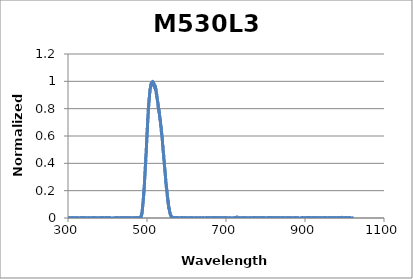
| Category | Normalized Intensity |
|---|---|
| 194.11 | 0.001 |
| 194.31 | -0.001 |
| 194.52 | 0 |
| 194.72 | -0.001 |
| 194.92 | 0 |
| 195.12 | 0 |
| 195.33 | 0.001 |
| 195.53 | -0.002 |
| 195.73 | -0.001 |
| 195.93 | 0 |
| 196.13 | -0.001 |
| 196.34 | -0.003 |
| 196.54 | 0 |
| 196.74 | -0.001 |
| 196.94 | -0.001 |
| 197.15 | -0.003 |
| 197.35 | -0.001 |
| 197.55 | -0.002 |
| 197.75 | -0.001 |
| 197.96 | -0.001 |
| 198.16 | -0.002 |
| 198.36 | -0.001 |
| 198.56 | 0 |
| 198.76 | 0 |
| 198.97 | 0.001 |
| 199.17 | -0.001 |
| 199.37 | 0.002 |
| 199.57 | -0.001 |
| 199.78 | 0 |
| 199.98 | 0 |
| 200.18 | -0.002 |
| 200.39 | 0.001 |
| 200.59 | -0.003 |
| 200.79 | -0.002 |
| 200.99 | -0.001 |
| 201.2 | 0.001 |
| 201.4 | -0.001 |
| 201.6 | 0 |
| 201.8 | 0.002 |
| 202.01 | -0.002 |
| 202.21 | -0.001 |
| 202.41 | -0.001 |
| 202.62 | -0.002 |
| 202.82 | 0 |
| 203.02 | 0.001 |
| 203.22 | 0.001 |
| 203.43 | 0 |
| 203.63 | 0.004 |
| 203.83 | -0.002 |
| 204.04 | -0.001 |
| 204.24 | 0.001 |
| 204.44 | -0.001 |
| 204.64 | -0.001 |
| 204.85 | -0.001 |
| 205.05 | 0.001 |
| 205.25 | -0.001 |
| 205.46 | 0 |
| 205.66 | -0.003 |
| 205.86 | -0.001 |
| 206.07 | -0.001 |
| 206.27 | -0.001 |
| 206.47 | -0.001 |
| 206.68 | -0.001 |
| 206.88 | -0.001 |
| 207.08 | 0 |
| 207.29 | -0.001 |
| 207.49 | 0 |
| 207.69 | -0.002 |
| 207.89 | 0.001 |
| 208.1 | -0.002 |
| 208.3 | -0.001 |
| 208.5 | -0.003 |
| 208.71 | 0.002 |
| 208.91 | -0.002 |
| 209.12 | -0.002 |
| 209.32 | 0.001 |
| 209.52 | 0 |
| 209.73 | -0.004 |
| 209.93 | 0 |
| 210.13 | 0 |
| 210.34 | -0.002 |
| 210.54 | -0.003 |
| 210.74 | 0.002 |
| 210.95 | -0.002 |
| 211.15 | 0 |
| 211.35 | -0.001 |
| 211.56 | -0.001 |
| 211.76 | -0.002 |
| 211.96 | 0.001 |
| 212.17 | -0.002 |
| 212.37 | 0.001 |
| 212.58 | 0 |
| 212.78 | 0.001 |
| 212.98 | 0 |
| 213.19 | 0 |
| 213.39 | -0.002 |
| 213.59 | -0.001 |
| 213.8 | -0.003 |
| 214.0 | -0.001 |
| 214.21 | -0.003 |
| 214.41 | 0.003 |
| 214.61 | -0.003 |
| 214.82 | 0 |
| 215.02 | -0.003 |
| 215.23 | -0.001 |
| 215.43 | 0.001 |
| 215.63 | -0.002 |
| 215.84 | 0.002 |
| 216.04 | -0.001 |
| 216.25 | -0.001 |
| 216.45 | 0 |
| 216.65 | 0 |
| 216.86 | 0 |
| 217.06 | 0.002 |
| 217.27 | -0.001 |
| 217.47 | -0.002 |
| 217.67 | 0.001 |
| 217.88 | -0.003 |
| 218.08 | 0.002 |
| 218.29 | -0.001 |
| 218.49 | 0 |
| 218.7 | -0.003 |
| 218.9 | 0 |
| 219.1 | -0.001 |
| 219.31 | -0.002 |
| 219.51 | 0 |
| 219.72 | 0.001 |
| 219.92 | -0.001 |
| 220.13 | 0.001 |
| 220.33 | -0.002 |
| 220.53 | -0.001 |
| 220.74 | 0 |
| 220.94 | 0 |
| 221.15 | -0.003 |
| 221.35 | 0 |
| 221.56 | -0.004 |
| 221.76 | 0 |
| 221.97 | -0.001 |
| 222.17 | -0.001 |
| 222.38 | -0.002 |
| 222.58 | -0.001 |
| 222.78 | -0.001 |
| 222.99 | -0.002 |
| 223.19 | -0.001 |
| 223.4 | 0 |
| 223.6 | -0.004 |
| 223.81 | 0.002 |
| 224.01 | -0.002 |
| 224.22 | 0 |
| 224.42 | -0.001 |
| 224.63 | -0.001 |
| 224.83 | -0.003 |
| 225.04 | 0 |
| 225.24 | -0.002 |
| 225.45 | 0.001 |
| 225.65 | -0.002 |
| 225.86 | 0 |
| 226.06 | 0 |
| 226.27 | 0.002 |
| 226.47 | -0.002 |
| 226.68 | 0 |
| 226.88 | -0.002 |
| 227.09 | 0.001 |
| 227.29 | -0.001 |
| 227.5 | 0.001 |
| 227.7 | 0.001 |
| 227.91 | 0 |
| 228.11 | -0.001 |
| 228.32 | 0 |
| 228.52 | -0.001 |
| 228.73 | -0.001 |
| 228.93 | -0.002 |
| 229.14 | -0.003 |
| 229.34 | -0.001 |
| 229.55 | -0.001 |
| 229.75 | -0.001 |
| 229.96 | -0.002 |
| 230.16 | 0.002 |
| 230.37 | -0.001 |
| 230.57 | -0.003 |
| 230.78 | 0.001 |
| 230.98 | 0.001 |
| 231.19 | 0 |
| 231.39 | -0.001 |
| 231.6 | 0 |
| 231.81 | -0.001 |
| 232.01 | -0.001 |
| 232.22 | 0 |
| 232.42 | 0 |
| 232.63 | 0 |
| 232.83 | 0 |
| 233.04 | -0.004 |
| 233.24 | -0.001 |
| 233.45 | 0 |
| 233.65 | -0.002 |
| 233.86 | -0.001 |
| 234.07 | -0.003 |
| 234.27 | -0.002 |
| 234.48 | 0.003 |
| 234.68 | 0 |
| 234.89 | -0.001 |
| 235.09 | 0 |
| 235.3 | -0.001 |
| 235.51 | 0.001 |
| 235.71 | -0.001 |
| 235.92 | 0 |
| 236.12 | 0 |
| 236.33 | -0.002 |
| 236.53 | 0 |
| 236.74 | -0.001 |
| 236.95 | -0.001 |
| 237.15 | -0.002 |
| 237.36 | -0.003 |
| 237.56 | -0.001 |
| 237.77 | -0.001 |
| 237.98 | -0.003 |
| 238.18 | 0 |
| 238.39 | -0.003 |
| 238.59 | 0.001 |
| 238.8 | -0.003 |
| 239.01 | -0.001 |
| 239.21 | 0.001 |
| 239.42 | -0.002 |
| 239.62 | -0.001 |
| 239.83 | -0.001 |
| 240.04 | -0.002 |
| 240.24 | -0.002 |
| 240.45 | 0 |
| 240.65 | -0.001 |
| 240.86 | -0.001 |
| 241.07 | -0.002 |
| 241.27 | 0.001 |
| 241.48 | -0.001 |
| 241.69 | -0.002 |
| 241.89 | 0.002 |
| 242.1 | -0.002 |
| 242.3 | 0 |
| 242.51 | 0 |
| 242.72 | 0 |
| 242.92 | -0.001 |
| 243.13 | 0 |
| 243.34 | -0.004 |
| 243.54 | -0.001 |
| 243.75 | -0.002 |
| 243.96 | 0 |
| 244.16 | -0.001 |
| 244.37 | 0.001 |
| 244.58 | -0.002 |
| 244.78 | -0.001 |
| 244.99 | -0.003 |
| 245.19 | -0.001 |
| 245.4 | -0.001 |
| 245.61 | -0.002 |
| 245.81 | -0.001 |
| 246.02 | -0.002 |
| 246.23 | 0.001 |
| 246.43 | 0 |
| 246.64 | -0.003 |
| 246.85 | 0 |
| 247.05 | -0.004 |
| 247.26 | -0.003 |
| 247.47 | -0.002 |
| 247.67 | 0 |
| 247.88 | 0 |
| 248.09 | 0 |
| 248.3 | 0 |
| 248.5 | -0.001 |
| 248.71 | -0.001 |
| 248.92 | 0.001 |
| 249.12 | 0 |
| 249.33 | 0 |
| 249.54 | -0.001 |
| 249.74 | 0 |
| 249.95 | -0.001 |
| 250.16 | -0.002 |
| 250.36 | -0.003 |
| 250.57 | -0.001 |
| 250.78 | -0.003 |
| 250.99 | -0.002 |
| 251.19 | 0 |
| 251.4 | 0 |
| 251.61 | 0 |
| 251.81 | 0.001 |
| 252.02 | 0 |
| 252.23 | 0.002 |
| 252.44 | -0.001 |
| 252.64 | -0.001 |
| 252.85 | -0.003 |
| 253.06 | -0.001 |
| 253.26 | 0 |
| 253.47 | 0.001 |
| 253.68 | -0.002 |
| 253.89 | 0.001 |
| 254.09 | -0.003 |
| 254.3 | -0.001 |
| 254.51 | 0.001 |
| 254.72 | 0.001 |
| 254.92 | -0.002 |
| 255.13 | -0.001 |
| 255.34 | 0 |
| 255.54 | -0.001 |
| 255.75 | 0.001 |
| 255.96 | 0 |
| 256.17 | -0.002 |
| 256.37 | 0 |
| 256.58 | -0.001 |
| 256.79 | 0 |
| 257.0 | 0 |
| 257.2 | 0.001 |
| 257.41 | -0.001 |
| 257.62 | -0.001 |
| 257.83 | -0.002 |
| 258.04 | -0.001 |
| 258.24 | -0.002 |
| 258.45 | -0.001 |
| 258.66 | -0.001 |
| 258.87 | -0.001 |
| 259.07 | -0.001 |
| 259.28 | -0.001 |
| 259.49 | -0.002 |
| 259.7 | -0.001 |
| 259.9 | -0.002 |
| 260.11 | 0 |
| 260.32 | -0.001 |
| 260.53 | 0 |
| 260.74 | -0.004 |
| 260.94 | 0 |
| 261.15 | 0 |
| 261.36 | -0.002 |
| 261.57 | -0.002 |
| 261.78 | -0.001 |
| 261.98 | -0.002 |
| 262.19 | 0 |
| 262.4 | -0.001 |
| 262.61 | -0.002 |
| 262.82 | -0.002 |
| 263.02 | -0.002 |
| 263.23 | -0.002 |
| 263.44 | 0.001 |
| 263.65 | -0.002 |
| 263.86 | 0 |
| 264.06 | -0.001 |
| 264.27 | -0.001 |
| 264.48 | 0.001 |
| 264.69 | 0.001 |
| 264.9 | -0.004 |
| 265.11 | -0.002 |
| 265.31 | -0.001 |
| 265.52 | 0 |
| 265.73 | -0.001 |
| 265.94 | 0.002 |
| 266.15 | -0.003 |
| 266.35 | -0.001 |
| 266.56 | -0.002 |
| 266.77 | -0.001 |
| 266.98 | -0.001 |
| 267.19 | 0 |
| 267.4 | -0.003 |
| 267.61 | -0.001 |
| 267.81 | -0.002 |
| 268.02 | 0 |
| 268.23 | 0.001 |
| 268.44 | 0.001 |
| 268.65 | -0.003 |
| 268.86 | 0 |
| 269.06 | -0.002 |
| 269.27 | 0.003 |
| 269.48 | -0.002 |
| 269.69 | 0.001 |
| 269.9 | -0.001 |
| 270.11 | 0 |
| 270.32 | 0 |
| 270.52 | -0.003 |
| 270.73 | -0.004 |
| 270.94 | 0 |
| 271.15 | 0 |
| 271.36 | -0.001 |
| 271.57 | -0.001 |
| 271.78 | 0 |
| 271.99 | -0.001 |
| 272.19 | 0.001 |
| 272.4 | -0.002 |
| 272.61 | 0 |
| 272.82 | 0 |
| 273.03 | -0.002 |
| 273.24 | -0.002 |
| 273.45 | 0.002 |
| 273.66 | 0 |
| 273.87 | -0.002 |
| 274.07 | -0.003 |
| 274.28 | 0 |
| 274.49 | -0.002 |
| 274.7 | 0.001 |
| 274.91 | -0.003 |
| 275.12 | -0.002 |
| 275.33 | -0.002 |
| 275.54 | -0.002 |
| 275.75 | -0.002 |
| 275.96 | 0.002 |
| 276.17 | -0.001 |
| 276.37 | -0.001 |
| 276.58 | 0 |
| 276.79 | -0.001 |
| 277.0 | 0 |
| 277.21 | 0.003 |
| 277.42 | 0.001 |
| 277.63 | 0.001 |
| 277.84 | 0 |
| 278.05 | -0.001 |
| 278.26 | 0 |
| 278.47 | -0.002 |
| 278.68 | 0 |
| 278.89 | 0 |
| 279.09 | 0 |
| 279.3 | 0 |
| 279.51 | -0.002 |
| 279.72 | 0.001 |
| 279.93 | -0.002 |
| 280.14 | -0.002 |
| 280.35 | 0.001 |
| 280.56 | 0 |
| 280.77 | 0 |
| 280.98 | 0.001 |
| 281.19 | 0 |
| 281.4 | 0 |
| 281.61 | -0.003 |
| 281.82 | 0 |
| 282.03 | -0.001 |
| 282.24 | 0.001 |
| 282.45 | -0.003 |
| 282.66 | -0.003 |
| 282.87 | -0.002 |
| 283.08 | -0.001 |
| 283.29 | -0.001 |
| 283.5 | -0.001 |
| 283.7 | 0 |
| 283.91 | -0.003 |
| 284.12 | 0.002 |
| 284.33 | 0 |
| 284.54 | -0.001 |
| 284.75 | 0.002 |
| 284.96 | 0.001 |
| 285.17 | 0 |
| 285.38 | -0.004 |
| 285.59 | -0.002 |
| 285.8 | -0.004 |
| 286.01 | 0 |
| 286.22 | 0 |
| 286.43 | 0 |
| 286.64 | 0 |
| 286.85 | 0.001 |
| 287.06 | -0.001 |
| 287.27 | -0.002 |
| 287.48 | 0 |
| 287.69 | 0 |
| 287.9 | -0.002 |
| 288.11 | -0.002 |
| 288.32 | -0.001 |
| 288.53 | 0 |
| 288.74 | 0 |
| 288.95 | 0.002 |
| 289.16 | 0.001 |
| 289.37 | 0 |
| 289.58 | -0.002 |
| 289.79 | 0 |
| 290.0 | -0.001 |
| 290.21 | -0.002 |
| 290.43 | 0 |
| 290.64 | -0.002 |
| 290.85 | -0.001 |
| 291.06 | -0.002 |
| 291.27 | -0.002 |
| 291.48 | 0 |
| 291.69 | -0.003 |
| 291.9 | -0.003 |
| 292.11 | -0.002 |
| 292.32 | -0.001 |
| 292.53 | -0.003 |
| 292.74 | 0.002 |
| 292.95 | -0.001 |
| 293.16 | 0.001 |
| 293.37 | 0 |
| 293.58 | 0 |
| 293.79 | -0.002 |
| 294.0 | 0 |
| 294.21 | -0.002 |
| 294.42 | 0.001 |
| 294.63 | 0 |
| 294.84 | -0.001 |
| 295.06 | -0.001 |
| 295.27 | 0 |
| 295.48 | -0.002 |
| 295.69 | 0 |
| 295.9 | 0.001 |
| 296.11 | -0.001 |
| 296.32 | -0.002 |
| 296.53 | 0.002 |
| 296.74 | -0.002 |
| 296.95 | 0.002 |
| 297.16 | -0.001 |
| 297.37 | -0.001 |
| 297.58 | 0 |
| 297.79 | -0.001 |
| 298.01 | -0.001 |
| 298.22 | -0.002 |
| 298.43 | 0 |
| 298.64 | 0.001 |
| 298.85 | 0 |
| 299.06 | -0.002 |
| 299.27 | -0.001 |
| 299.48 | 0.004 |
| 299.69 | 0 |
| 299.9 | 0 |
| 300.12 | -0.002 |
| 300.33 | -0.002 |
| 300.54 | -0.003 |
| 300.75 | -0.001 |
| 300.96 | 0.001 |
| 301.17 | 0 |
| 301.38 | -0.001 |
| 301.59 | -0.002 |
| 301.8 | 0 |
| 302.02 | 0.001 |
| 302.23 | -0.001 |
| 302.44 | 0 |
| 302.65 | 0.001 |
| 302.86 | 0.001 |
| 303.07 | -0.003 |
| 303.28 | -0.001 |
| 303.49 | -0.002 |
| 303.71 | 0.003 |
| 303.92 | 0 |
| 304.13 | -0.002 |
| 304.34 | 0 |
| 304.55 | 0.001 |
| 304.76 | -0.002 |
| 304.97 | -0.004 |
| 305.18 | 0 |
| 305.4 | 0.001 |
| 305.61 | -0.003 |
| 305.82 | 0 |
| 306.03 | -0.001 |
| 306.24 | 0 |
| 306.45 | -0.001 |
| 306.67 | 0.001 |
| 306.88 | -0.002 |
| 307.09 | -0.001 |
| 307.3 | -0.003 |
| 307.51 | 0.001 |
| 307.72 | 0 |
| 307.93 | 0 |
| 308.15 | -0.001 |
| 308.36 | -0.002 |
| 308.57 | 0.002 |
| 308.78 | 0 |
| 308.99 | -0.003 |
| 309.21 | -0.001 |
| 309.42 | 0 |
| 309.63 | 0 |
| 309.84 | -0.001 |
| 310.05 | 0.002 |
| 310.26 | -0.001 |
| 310.48 | -0.001 |
| 310.69 | -0.001 |
| 310.9 | 0 |
| 311.11 | 0 |
| 311.32 | 0 |
| 311.54 | -0.001 |
| 311.75 | 0 |
| 311.96 | -0.001 |
| 312.17 | 0.001 |
| 312.38 | -0.004 |
| 312.6 | 0.001 |
| 312.81 | 0.001 |
| 313.02 | 0.001 |
| 313.23 | 0 |
| 313.44 | 0.001 |
| 313.66 | -0.002 |
| 313.87 | 0 |
| 314.08 | -0.001 |
| 314.29 | 0.001 |
| 314.5 | 0 |
| 314.72 | -0.001 |
| 314.93 | -0.001 |
| 315.14 | 0 |
| 315.35 | 0.002 |
| 315.56 | 0.001 |
| 315.78 | 0 |
| 315.99 | 0.001 |
| 316.2 | -0.002 |
| 316.41 | -0.001 |
| 316.63 | 0 |
| 316.84 | 0 |
| 317.05 | 0 |
| 317.26 | 0.001 |
| 317.48 | 0.001 |
| 317.69 | 0 |
| 317.9 | -0.001 |
| 318.11 | -0.002 |
| 318.33 | -0.002 |
| 318.54 | 0.001 |
| 318.75 | 0 |
| 318.96 | -0.002 |
| 319.17 | 0.001 |
| 319.39 | 0 |
| 319.6 | -0.001 |
| 319.81 | -0.001 |
| 320.03 | -0.001 |
| 320.24 | -0.001 |
| 320.45 | 0.001 |
| 320.66 | 0 |
| 320.88 | 0 |
| 321.09 | -0.001 |
| 321.3 | -0.002 |
| 321.51 | 0 |
| 321.73 | -0.003 |
| 321.94 | 0 |
| 322.15 | -0.001 |
| 322.36 | -0.001 |
| 322.58 | -0.001 |
| 322.79 | 0.002 |
| 323.0 | -0.002 |
| 323.22 | 0.001 |
| 323.43 | 0 |
| 323.64 | -0.001 |
| 323.85 | -0.001 |
| 324.07 | 0.001 |
| 324.28 | -0.002 |
| 324.49 | -0.001 |
| 324.71 | -0.001 |
| 324.92 | 0.001 |
| 325.13 | -0.003 |
| 325.34 | 0.001 |
| 325.56 | -0.001 |
| 325.77 | -0.002 |
| 325.98 | -0.002 |
| 326.2 | -0.001 |
| 326.41 | -0.001 |
| 326.62 | 0 |
| 326.84 | -0.001 |
| 327.05 | 0 |
| 327.26 | 0 |
| 327.47 | -0.001 |
| 327.69 | 0 |
| 327.9 | -0.002 |
| 328.11 | -0.002 |
| 328.33 | 0 |
| 328.54 | -0.002 |
| 328.75 | 0 |
| 328.97 | -0.002 |
| 329.18 | -0.001 |
| 329.39 | -0.001 |
| 329.61 | 0.001 |
| 329.82 | 0 |
| 330.03 | 0 |
| 330.25 | -0.001 |
| 330.46 | 0 |
| 330.67 | -0.002 |
| 330.89 | 0 |
| 331.1 | -0.002 |
| 331.31 | -0.001 |
| 331.53 | -0.003 |
| 331.74 | 0.001 |
| 331.95 | -0.001 |
| 332.17 | 0.002 |
| 332.38 | -0.002 |
| 332.59 | 0.001 |
| 332.81 | 0 |
| 333.02 | -0.002 |
| 333.24 | 0.002 |
| 333.45 | 0.002 |
| 333.66 | -0.001 |
| 333.88 | -0.001 |
| 334.09 | 0.002 |
| 334.3 | -0.001 |
| 334.52 | 0.001 |
| 334.73 | 0.002 |
| 334.94 | 0 |
| 335.16 | 0 |
| 335.37 | -0.004 |
| 335.59 | 0.001 |
| 335.8 | -0.002 |
| 336.01 | 0.002 |
| 336.23 | -0.001 |
| 336.44 | 0.001 |
| 336.65 | 0.002 |
| 336.87 | -0.001 |
| 337.08 | 0 |
| 337.3 | -0.001 |
| 337.51 | -0.003 |
| 337.72 | 0.003 |
| 337.94 | 0 |
| 338.15 | -0.001 |
| 338.37 | -0.001 |
| 338.58 | 0.001 |
| 338.79 | -0.002 |
| 339.01 | 0 |
| 339.22 | -0.002 |
| 339.44 | -0.001 |
| 339.65 | -0.002 |
| 339.86 | 0.001 |
| 340.08 | -0.003 |
| 340.29 | 0.001 |
| 340.51 | -0.001 |
| 340.72 | -0.001 |
| 340.93 | -0.003 |
| 341.15 | 0.001 |
| 341.36 | 0 |
| 341.58 | -0.001 |
| 341.79 | 0.001 |
| 342.0 | -0.001 |
| 342.22 | -0.002 |
| 342.43 | 0.001 |
| 342.65 | 0.001 |
| 342.86 | 0.001 |
| 343.08 | 0.001 |
| 343.29 | 0.001 |
| 343.5 | 0 |
| 343.72 | -0.001 |
| 343.93 | -0.002 |
| 344.15 | -0.002 |
| 344.36 | -0.001 |
| 344.58 | -0.001 |
| 344.79 | -0.001 |
| 345.0 | -0.002 |
| 345.22 | -0.001 |
| 345.43 | -0.002 |
| 345.65 | -0.001 |
| 345.86 | 0 |
| 346.08 | 0 |
| 346.29 | -0.001 |
| 346.51 | -0.001 |
| 346.72 | 0.001 |
| 346.94 | -0.002 |
| 347.15 | -0.001 |
| 347.36 | 0 |
| 347.58 | 0 |
| 347.79 | -0.001 |
| 348.01 | 0 |
| 348.22 | -0.002 |
| 348.44 | -0.002 |
| 348.65 | -0.002 |
| 348.87 | 0 |
| 349.08 | 0 |
| 349.3 | -0.001 |
| 349.51 | 0 |
| 349.73 | -0.001 |
| 349.94 | -0.001 |
| 350.16 | 0 |
| 350.37 | 0 |
| 350.59 | 0.001 |
| 350.8 | -0.003 |
| 351.01 | 0.001 |
| 351.23 | -0.002 |
| 351.44 | 0.002 |
| 351.66 | -0.002 |
| 351.87 | -0.001 |
| 352.09 | -0.002 |
| 352.3 | 0 |
| 352.52 | -0.002 |
| 352.73 | 0 |
| 352.95 | -0.003 |
| 353.16 | 0.001 |
| 353.38 | 0 |
| 353.59 | 0.001 |
| 353.81 | -0.001 |
| 354.02 | -0.001 |
| 354.24 | -0.003 |
| 354.45 | 0 |
| 354.67 | -0.003 |
| 354.88 | 0 |
| 355.1 | -0.001 |
| 355.32 | -0.001 |
| 355.53 | 0 |
| 355.75 | 0 |
| 355.96 | 0 |
| 356.18 | 0 |
| 356.39 | 0.001 |
| 356.61 | -0.001 |
| 356.82 | -0.002 |
| 357.04 | -0.002 |
| 357.25 | -0.002 |
| 357.47 | 0 |
| 357.68 | -0.003 |
| 357.9 | -0.002 |
| 358.11 | -0.001 |
| 358.33 | 0.001 |
| 358.54 | -0.001 |
| 358.76 | -0.001 |
| 358.98 | -0.002 |
| 359.19 | -0.001 |
| 359.41 | 0 |
| 359.62 | 0 |
| 359.84 | 0 |
| 360.05 | 0.001 |
| 360.27 | -0.001 |
| 360.48 | 0 |
| 360.7 | -0.003 |
| 360.91 | 0 |
| 361.13 | 0 |
| 361.35 | 0.001 |
| 361.56 | 0 |
| 361.78 | -0.002 |
| 361.99 | 0 |
| 362.21 | -0.001 |
| 362.42 | 0.001 |
| 362.64 | 0 |
| 362.86 | -0.001 |
| 363.07 | -0.001 |
| 363.29 | -0.001 |
| 363.5 | -0.002 |
| 363.72 | -0.001 |
| 363.93 | 0.001 |
| 364.15 | -0.001 |
| 364.37 | 0.002 |
| 364.58 | -0.002 |
| 364.8 | 0.001 |
| 365.01 | -0.002 |
| 365.23 | 0 |
| 365.45 | -0.002 |
| 365.66 | -0.001 |
| 365.88 | 0 |
| 366.09 | -0.002 |
| 366.31 | 0.002 |
| 366.53 | 0 |
| 366.74 | 0 |
| 366.96 | 0.001 |
| 367.17 | -0.003 |
| 367.39 | 0 |
| 367.61 | -0.002 |
| 367.82 | -0.002 |
| 368.04 | -0.004 |
| 368.25 | 0 |
| 368.47 | -0.001 |
| 368.69 | -0.002 |
| 368.9 | -0.001 |
| 369.12 | 0 |
| 369.33 | 0.002 |
| 369.55 | 0.002 |
| 369.77 | -0.003 |
| 369.98 | -0.001 |
| 370.2 | 0 |
| 370.41 | 0 |
| 370.63 | -0.003 |
| 370.85 | -0.001 |
| 371.06 | -0.001 |
| 371.28 | 0 |
| 371.5 | 0 |
| 371.71 | 0 |
| 371.93 | -0.001 |
| 372.15 | 0.001 |
| 372.36 | -0.002 |
| 372.58 | 0.002 |
| 372.79 | 0 |
| 373.01 | -0.002 |
| 373.23 | 0 |
| 373.44 | -0.001 |
| 373.66 | 0 |
| 373.88 | 0.001 |
| 374.09 | 0 |
| 374.31 | 0 |
| 374.53 | -0.001 |
| 374.74 | -0.001 |
| 374.96 | 0 |
| 375.18 | -0.001 |
| 375.39 | -0.001 |
| 375.61 | 0 |
| 375.83 | -0.001 |
| 376.04 | -0.001 |
| 376.26 | -0.001 |
| 376.48 | -0.002 |
| 376.69 | -0.001 |
| 376.91 | -0.001 |
| 377.13 | -0.001 |
| 377.34 | 0.001 |
| 377.56 | -0.002 |
| 377.78 | 0 |
| 377.99 | -0.002 |
| 378.21 | 0.001 |
| 378.43 | -0.002 |
| 378.64 | 0.001 |
| 378.86 | -0.002 |
| 379.08 | 0 |
| 379.29 | 0 |
| 379.51 | 0.001 |
| 379.73 | -0.002 |
| 379.94 | -0.001 |
| 380.16 | 0.002 |
| 380.38 | 0 |
| 380.6 | -0.002 |
| 380.81 | 0 |
| 381.03 | 0.001 |
| 381.25 | 0 |
| 381.46 | -0.002 |
| 381.68 | 0.001 |
| 381.9 | -0.004 |
| 382.11 | -0.001 |
| 382.33 | -0.001 |
| 382.55 | 0.001 |
| 382.77 | -0.001 |
| 382.98 | 0.001 |
| 383.2 | -0.002 |
| 383.42 | -0.001 |
| 383.63 | 0.002 |
| 383.85 | 0.002 |
| 384.07 | -0.002 |
| 384.29 | -0.002 |
| 384.5 | -0.001 |
| 384.72 | 0 |
| 384.94 | -0.001 |
| 385.15 | 0 |
| 385.37 | 0 |
| 385.59 | 0.003 |
| 385.81 | 0 |
| 386.02 | -0.001 |
| 386.24 | -0.002 |
| 386.46 | -0.002 |
| 386.68 | 0 |
| 386.89 | 0.001 |
| 387.11 | 0 |
| 387.33 | 0.004 |
| 387.55 | -0.002 |
| 387.76 | -0.001 |
| 387.98 | 0 |
| 388.2 | -0.003 |
| 388.42 | -0.001 |
| 388.63 | 0.001 |
| 388.85 | 0 |
| 389.07 | 0 |
| 389.29 | -0.001 |
| 389.5 | 0 |
| 389.72 | -0.002 |
| 389.94 | 0.002 |
| 390.16 | -0.001 |
| 390.37 | 0 |
| 390.59 | 0 |
| 390.81 | 0.001 |
| 391.03 | -0.002 |
| 391.24 | 0 |
| 391.46 | 0 |
| 391.68 | 0.001 |
| 391.9 | -0.001 |
| 392.11 | -0.001 |
| 392.33 | 0 |
| 392.55 | -0.002 |
| 392.77 | -0.003 |
| 392.99 | 0 |
| 393.2 | -0.003 |
| 393.42 | -0.001 |
| 393.64 | -0.001 |
| 393.86 | 0.002 |
| 394.07 | -0.001 |
| 394.29 | 0 |
| 394.51 | -0.001 |
| 394.73 | 0 |
| 394.95 | -0.003 |
| 395.16 | 0.002 |
| 395.38 | 0 |
| 395.6 | 0.001 |
| 395.82 | -0.001 |
| 396.04 | 0 |
| 396.25 | -0.001 |
| 396.47 | 0 |
| 396.69 | -0.001 |
| 396.91 | -0.001 |
| 397.13 | 0.001 |
| 397.34 | 0 |
| 397.56 | -0.002 |
| 397.78 | 0.001 |
| 398.0 | 0 |
| 398.22 | 0.001 |
| 398.44 | -0.003 |
| 398.65 | 0.003 |
| 398.87 | 0.001 |
| 399.09 | -0.001 |
| 399.31 | 0.001 |
| 399.53 | 0.002 |
| 399.74 | -0.002 |
| 399.96 | 0.001 |
| 400.18 | -0.001 |
| 400.4 | -0.001 |
| 400.62 | -0.001 |
| 400.84 | 0 |
| 401.05 | 0 |
| 401.27 | -0.001 |
| 401.49 | 0 |
| 401.71 | 0 |
| 401.93 | -0.003 |
| 402.15 | -0.001 |
| 402.36 | -0.002 |
| 402.58 | -0.002 |
| 402.8 | 0 |
| 403.02 | 0.001 |
| 403.24 | 0.001 |
| 403.46 | -0.001 |
| 403.68 | 0 |
| 403.89 | -0.001 |
| 404.11 | -0.002 |
| 404.33 | -0.001 |
| 404.55 | 0 |
| 404.77 | -0.001 |
| 404.99 | 0.002 |
| 405.21 | -0.001 |
| 405.42 | -0.001 |
| 405.64 | 0.003 |
| 405.86 | 0 |
| 406.08 | -0.001 |
| 406.3 | -0.001 |
| 406.52 | -0.002 |
| 406.74 | -0.002 |
| 406.95 | 0 |
| 407.17 | 0.002 |
| 407.39 | 0.001 |
| 407.61 | 0.001 |
| 407.83 | -0.002 |
| 408.05 | 0.002 |
| 408.27 | -0.001 |
| 408.49 | -0.001 |
| 408.71 | 0 |
| 408.92 | -0.001 |
| 409.14 | -0.003 |
| 409.36 | 0.001 |
| 409.58 | -0.002 |
| 409.8 | 0.001 |
| 410.02 | 0 |
| 410.24 | 0.001 |
| 410.46 | 0 |
| 410.68 | 0.002 |
| 410.89 | -0.001 |
| 411.11 | 0 |
| 411.33 | -0.002 |
| 411.55 | 0.001 |
| 411.77 | 0 |
| 411.99 | 0 |
| 412.21 | -0.002 |
| 412.43 | -0.001 |
| 412.65 | -0.002 |
| 412.87 | 0.001 |
| 413.08 | -0.004 |
| 413.3 | 0 |
| 413.52 | -0.001 |
| 413.74 | 0 |
| 413.96 | -0.002 |
| 414.18 | 0 |
| 414.4 | -0.001 |
| 414.62 | -0.001 |
| 414.84 | -0.002 |
| 415.06 | 0.001 |
| 415.28 | -0.001 |
| 415.5 | -0.001 |
| 415.72 | 0.001 |
| 415.93 | -0.001 |
| 416.15 | 0 |
| 416.37 | -0.002 |
| 416.59 | -0.002 |
| 416.81 | 0.001 |
| 417.03 | -0.001 |
| 417.25 | -0.001 |
| 417.47 | -0.003 |
| 417.69 | -0.002 |
| 417.91 | 0 |
| 418.13 | 0 |
| 418.35 | -0.001 |
| 418.57 | -0.001 |
| 418.79 | 0.001 |
| 419.01 | 0 |
| 419.23 | -0.001 |
| 419.45 | -0.001 |
| 419.67 | -0.003 |
| 419.89 | 0 |
| 420.1 | -0.002 |
| 420.32 | -0.001 |
| 420.54 | 0 |
| 420.76 | 0 |
| 420.98 | 0.001 |
| 421.2 | -0.001 |
| 421.42 | -0.001 |
| 421.64 | 0 |
| 421.86 | -0.001 |
| 422.08 | 0.001 |
| 422.3 | 0.001 |
| 422.52 | -0.002 |
| 422.74 | -0.001 |
| 422.96 | 0.001 |
| 423.18 | 0.002 |
| 423.4 | 0.001 |
| 423.62 | -0.002 |
| 423.84 | 0.001 |
| 424.06 | -0.001 |
| 424.28 | 0 |
| 424.5 | 0 |
| 424.72 | 0.001 |
| 424.94 | 0.001 |
| 425.16 | 0 |
| 425.38 | -0.001 |
| 425.6 | 0.001 |
| 425.82 | -0.001 |
| 426.04 | 0.002 |
| 426.26 | -0.001 |
| 426.48 | -0.002 |
| 426.7 | -0.001 |
| 426.92 | -0.001 |
| 427.14 | -0.002 |
| 427.36 | 0 |
| 427.58 | -0.002 |
| 427.8 | 0.002 |
| 428.02 | -0.002 |
| 428.24 | -0.003 |
| 428.46 | 0 |
| 428.68 | -0.001 |
| 428.9 | -0.001 |
| 429.12 | -0.002 |
| 429.34 | -0.001 |
| 429.56 | 0 |
| 429.78 | -0.003 |
| 430.0 | -0.002 |
| 430.22 | -0.001 |
| 430.44 | -0.002 |
| 430.66 | -0.003 |
| 430.88 | 0 |
| 431.1 | 0 |
| 431.32 | -0.001 |
| 431.54 | -0.001 |
| 431.76 | 0.001 |
| 431.98 | -0.002 |
| 432.2 | 0 |
| 432.42 | 0 |
| 432.64 | 0.001 |
| 432.87 | 0 |
| 433.09 | 0 |
| 433.31 | -0.002 |
| 433.53 | 0.001 |
| 433.75 | 0 |
| 433.97 | 0.001 |
| 434.19 | 0 |
| 434.41 | -0.001 |
| 434.63 | -0.003 |
| 434.85 | 0 |
| 435.07 | 0 |
| 435.29 | 0.001 |
| 435.51 | 0 |
| 435.73 | -0.002 |
| 435.95 | -0.002 |
| 436.17 | 0.001 |
| 436.39 | 0 |
| 436.61 | 0.001 |
| 436.83 | 0.003 |
| 437.06 | -0.001 |
| 437.28 | 0 |
| 437.5 | 0 |
| 437.72 | 0 |
| 437.94 | 0 |
| 438.16 | 0 |
| 438.38 | -0.001 |
| 438.6 | -0.002 |
| 438.82 | 0.001 |
| 439.04 | -0.001 |
| 439.26 | -0.001 |
| 439.48 | 0 |
| 439.7 | 0.002 |
| 439.93 | 0 |
| 440.15 | -0.001 |
| 440.37 | 0 |
| 440.59 | -0.001 |
| 440.81 | -0.002 |
| 441.03 | -0.001 |
| 441.25 | -0.003 |
| 441.47 | 0.001 |
| 441.69 | 0.001 |
| 441.91 | -0.001 |
| 442.13 | -0.001 |
| 442.36 | 0.001 |
| 442.58 | 0 |
| 442.8 | 0.002 |
| 443.02 | -0.002 |
| 443.24 | -0.001 |
| 443.46 | 0 |
| 443.68 | 0 |
| 443.9 | -0.001 |
| 444.12 | -0.002 |
| 444.35 | -0.001 |
| 444.57 | 0 |
| 444.79 | 0 |
| 445.01 | 0 |
| 445.23 | -0.002 |
| 445.45 | 0 |
| 445.67 | -0.002 |
| 445.89 | -0.003 |
| 446.12 | -0.001 |
| 446.34 | 0.004 |
| 446.56 | -0.002 |
| 446.78 | -0.001 |
| 447.0 | 0 |
| 447.22 | 0.001 |
| 447.44 | 0.002 |
| 447.66 | 0.002 |
| 447.89 | -0.001 |
| 448.11 | -0.002 |
| 448.33 | 0.001 |
| 448.55 | -0.001 |
| 448.77 | 0 |
| 448.99 | 0.001 |
| 449.21 | -0.001 |
| 449.44 | -0.001 |
| 449.66 | -0.001 |
| 449.88 | -0.003 |
| 450.1 | 0 |
| 450.32 | 0.001 |
| 450.54 | -0.001 |
| 450.76 | -0.001 |
| 450.99 | -0.001 |
| 451.21 | 0 |
| 451.43 | -0.002 |
| 451.65 | -0.001 |
| 451.87 | -0.002 |
| 452.09 | -0.002 |
| 452.32 | 0 |
| 452.54 | 0.001 |
| 452.76 | -0.003 |
| 452.98 | -0.001 |
| 453.2 | -0.002 |
| 453.42 | 0.001 |
| 453.65 | -0.002 |
| 453.87 | -0.001 |
| 454.09 | 0 |
| 454.31 | 0.001 |
| 454.53 | 0 |
| 454.75 | 0 |
| 454.98 | 0.001 |
| 455.2 | 0 |
| 455.42 | 0 |
| 455.64 | 0 |
| 455.86 | -0.005 |
| 456.09 | -0.001 |
| 456.31 | -0.001 |
| 456.53 | 0.001 |
| 456.75 | -0.002 |
| 456.97 | 0 |
| 457.19 | -0.001 |
| 457.42 | -0.001 |
| 457.64 | 0.002 |
| 457.86 | -0.001 |
| 458.08 | -0.003 |
| 458.3 | -0.003 |
| 458.53 | 0.001 |
| 458.75 | -0.001 |
| 458.97 | 0 |
| 459.19 | 0 |
| 459.41 | -0.001 |
| 459.64 | -0.002 |
| 459.86 | -0.002 |
| 460.08 | 0 |
| 460.3 | 0.001 |
| 460.53 | 0 |
| 460.75 | 0.001 |
| 460.97 | 0 |
| 461.19 | 0.001 |
| 461.41 | 0 |
| 461.64 | 0 |
| 461.86 | -0.005 |
| 462.08 | 0.001 |
| 462.3 | 0 |
| 462.53 | -0.001 |
| 462.75 | 0 |
| 462.97 | -0.001 |
| 463.19 | -0.001 |
| 463.41 | -0.001 |
| 463.64 | -0.002 |
| 463.86 | 0 |
| 464.08 | -0.002 |
| 464.3 | -0.002 |
| 464.53 | -0.001 |
| 464.75 | 0.001 |
| 464.97 | -0.003 |
| 465.19 | 0.002 |
| 465.42 | -0.001 |
| 465.64 | 0 |
| 465.86 | -0.001 |
| 466.08 | -0.002 |
| 466.31 | -0.002 |
| 466.53 | 0 |
| 466.75 | -0.001 |
| 466.97 | -0.002 |
| 467.2 | -0.001 |
| 467.42 | 0 |
| 467.64 | -0.001 |
| 467.86 | 0.002 |
| 468.09 | -0.002 |
| 468.31 | -0.002 |
| 468.53 | -0.002 |
| 468.75 | -0.001 |
| 468.98 | -0.001 |
| 469.2 | 0.002 |
| 469.42 | -0.002 |
| 469.64 | -0.001 |
| 469.87 | 0.002 |
| 470.09 | 0 |
| 470.31 | 0.001 |
| 470.54 | -0.001 |
| 470.76 | -0.004 |
| 470.98 | 0.003 |
| 471.2 | 0 |
| 471.43 | -0.001 |
| 471.65 | 0.001 |
| 471.87 | 0 |
| 472.09 | -0.003 |
| 472.32 | 0 |
| 472.54 | -0.002 |
| 472.76 | 0.001 |
| 472.99 | 0.002 |
| 473.21 | 0 |
| 473.43 | 0.001 |
| 473.65 | -0.001 |
| 473.88 | 0.001 |
| 474.1 | 0.002 |
| 474.32 | -0.001 |
| 474.55 | 0 |
| 474.77 | -0.001 |
| 474.99 | -0.001 |
| 475.22 | -0.001 |
| 475.44 | 0.001 |
| 475.66 | -0.001 |
| 475.88 | 0.002 |
| 476.11 | -0.002 |
| 476.33 | 0 |
| 476.55 | 0.001 |
| 476.78 | 0.001 |
| 477.0 | -0.001 |
| 477.22 | 0 |
| 477.45 | -0.001 |
| 477.67 | 0 |
| 477.89 | -0.001 |
| 478.12 | 0.001 |
| 478.34 | -0.002 |
| 478.56 | 0.002 |
| 478.79 | 0 |
| 479.01 | -0.002 |
| 479.23 | 0 |
| 479.46 | 0.001 |
| 479.68 | 0.001 |
| 479.9 | 0.001 |
| 480.13 | 0 |
| 480.35 | -0.003 |
| 480.57 | 0.001 |
| 480.8 | 0.001 |
| 481.02 | 0.001 |
| 481.24 | 0.001 |
| 481.47 | 0 |
| 481.69 | 0.001 |
| 481.91 | -0.001 |
| 482.14 | 0.003 |
| 482.36 | 0.005 |
| 482.58 | 0.002 |
| 482.81 | 0.004 |
| 483.03 | 0 |
| 483.25 | 0.002 |
| 483.48 | 0.005 |
| 483.7 | 0.004 |
| 483.92 | 0.006 |
| 484.15 | 0.009 |
| 484.37 | 0.006 |
| 484.59 | 0.006 |
| 484.82 | 0.009 |
| 485.04 | 0.013 |
| 485.26 | 0.015 |
| 485.49 | 0.019 |
| 485.71 | 0.017 |
| 485.94 | 0.019 |
| 486.16 | 0.018 |
| 486.38 | 0.026 |
| 486.61 | 0.025 |
| 486.83 | 0.036 |
| 487.05 | 0.032 |
| 487.28 | 0.043 |
| 487.5 | 0.042 |
| 487.73 | 0.046 |
| 487.95 | 0.055 |
| 488.17 | 0.063 |
| 488.4 | 0.063 |
| 488.62 | 0.071 |
| 488.84 | 0.077 |
| 489.07 | 0.086 |
| 489.29 | 0.089 |
| 489.52 | 0.1 |
| 489.74 | 0.106 |
| 489.96 | 0.118 |
| 490.19 | 0.119 |
| 490.41 | 0.128 |
| 490.64 | 0.135 |
| 490.86 | 0.146 |
| 491.08 | 0.147 |
| 491.31 | 0.159 |
| 491.53 | 0.165 |
| 491.76 | 0.187 |
| 491.98 | 0.181 |
| 492.2 | 0.197 |
| 492.43 | 0.203 |
| 492.65 | 0.217 |
| 492.88 | 0.215 |
| 493.1 | 0.24 |
| 493.32 | 0.241 |
| 493.55 | 0.256 |
| 493.77 | 0.265 |
| 494.0 | 0.281 |
| 494.22 | 0.284 |
| 494.44 | 0.301 |
| 494.67 | 0.311 |
| 494.89 | 0.323 |
| 495.12 | 0.329 |
| 495.34 | 0.35 |
| 495.56 | 0.355 |
| 495.79 | 0.372 |
| 496.01 | 0.385 |
| 496.24 | 0.393 |
| 496.46 | 0.402 |
| 496.69 | 0.424 |
| 496.91 | 0.427 |
| 497.13 | 0.448 |
| 497.36 | 0.45 |
| 497.58 | 0.47 |
| 497.81 | 0.475 |
| 498.03 | 0.5 |
| 498.26 | 0.503 |
| 498.48 | 0.516 |
| 498.71 | 0.532 |
| 498.93 | 0.552 |
| 499.15 | 0.55 |
| 499.38 | 0.573 |
| 499.6 | 0.577 |
| 499.83 | 0.605 |
| 500.05 | 0.608 |
| 500.28 | 0.621 |
| 500.5 | 0.638 |
| 500.73 | 0.659 |
| 500.95 | 0.653 |
| 501.17 | 0.677 |
| 501.4 | 0.682 |
| 501.62 | 0.697 |
| 501.85 | 0.708 |
| 502.07 | 0.728 |
| 502.3 | 0.726 |
| 502.52 | 0.748 |
| 502.75 | 0.749 |
| 502.97 | 0.772 |
| 503.2 | 0.779 |
| 503.42 | 0.797 |
| 503.64 | 0.808 |
| 503.87 | 0.818 |
| 504.09 | 0.814 |
| 504.32 | 0.831 |
| 504.54 | 0.838 |
| 504.77 | 0.845 |
| 504.99 | 0.85 |
| 505.22 | 0.856 |
| 505.44 | 0.87 |
| 505.67 | 0.873 |
| 505.89 | 0.871 |
| 506.12 | 0.895 |
| 506.34 | 0.901 |
| 506.57 | 0.905 |
| 506.79 | 0.917 |
| 507.02 | 0.916 |
| 507.24 | 0.923 |
| 507.47 | 0.923 |
| 507.69 | 0.931 |
| 507.92 | 0.945 |
| 508.14 | 0.947 |
| 508.37 | 0.951 |
| 508.59 | 0.948 |
| 508.82 | 0.958 |
| 509.04 | 0.956 |
| 509.27 | 0.959 |
| 509.49 | 0.96 |
| 509.72 | 0.971 |
| 509.94 | 0.97 |
| 510.17 | 0.972 |
| 510.39 | 0.983 |
| 510.62 | 0.979 |
| 510.84 | 0.972 |
| 511.07 | 0.973 |
| 511.29 | 0.985 |
| 511.52 | 0.988 |
| 511.74 | 0.971 |
| 511.97 | 0.992 |
| 512.19 | 0.978 |
| 512.42 | 0.992 |
| 512.64 | 0.992 |
| 512.87 | 0.983 |
| 513.09 | 0.981 |
| 513.32 | 0.992 |
| 513.54 | 0.978 |
| 513.77 | 0.986 |
| 513.99 | 0.981 |
| 514.22 | 1 |
| 514.44 | 0.975 |
| 514.67 | 0.99 |
| 514.89 | 0.972 |
| 515.12 | 0.984 |
| 515.34 | 0.978 |
| 515.57 | 0.99 |
| 515.8 | 0.979 |
| 516.02 | 0.992 |
| 516.25 | 0.983 |
| 516.47 | 0.99 |
| 516.7 | 0.971 |
| 516.92 | 0.981 |
| 517.15 | 0.988 |
| 517.37 | 0.973 |
| 517.6 | 0.971 |
| 517.82 | 0.977 |
| 518.05 | 0.974 |
| 518.27 | 0.974 |
| 518.5 | 0.976 |
| 518.73 | 0.97 |
| 518.95 | 0.969 |
| 519.18 | 0.965 |
| 519.4 | 0.972 |
| 519.63 | 0.964 |
| 519.85 | 0.968 |
| 520.08 | 0.958 |
| 520.3 | 0.964 |
| 520.53 | 0.947 |
| 520.76 | 0.967 |
| 520.98 | 0.946 |
| 521.21 | 0.951 |
| 521.43 | 0.937 |
| 521.66 | 0.947 |
| 521.88 | 0.936 |
| 522.11 | 0.949 |
| 522.34 | 0.942 |
| 522.56 | 0.932 |
| 522.79 | 0.935 |
| 523.01 | 0.928 |
| 523.24 | 0.925 |
| 523.46 | 0.911 |
| 523.69 | 0.908 |
| 523.92 | 0.91 |
| 524.14 | 0.903 |
| 524.37 | 0.907 |
| 524.59 | 0.895 |
| 524.82 | 0.885 |
| 525.05 | 0.886 |
| 525.27 | 0.888 |
| 525.5 | 0.878 |
| 525.72 | 0.873 |
| 525.95 | 0.867 |
| 526.17 | 0.868 |
| 526.4 | 0.857 |
| 526.63 | 0.853 |
| 526.85 | 0.853 |
| 527.08 | 0.852 |
| 527.3 | 0.843 |
| 527.53 | 0.844 |
| 527.76 | 0.824 |
| 527.98 | 0.823 |
| 528.21 | 0.826 |
| 528.43 | 0.823 |
| 528.66 | 0.803 |
| 528.89 | 0.806 |
| 529.11 | 0.791 |
| 529.34 | 0.801 |
| 529.56 | 0.79 |
| 529.79 | 0.792 |
| 530.02 | 0.789 |
| 530.24 | 0.792 |
| 530.47 | 0.789 |
| 530.7 | 0.774 |
| 530.92 | 0.77 |
| 531.15 | 0.777 |
| 531.37 | 0.758 |
| 531.6 | 0.754 |
| 531.83 | 0.74 |
| 532.05 | 0.749 |
| 532.28 | 0.739 |
| 532.51 | 0.736 |
| 532.73 | 0.732 |
| 532.96 | 0.726 |
| 533.18 | 0.716 |
| 533.41 | 0.721 |
| 533.64 | 0.708 |
| 533.86 | 0.71 |
| 534.09 | 0.693 |
| 534.32 | 0.696 |
| 534.54 | 0.688 |
| 534.77 | 0.681 |
| 535.0 | 0.676 |
| 535.22 | 0.676 |
| 535.45 | 0.663 |
| 535.67 | 0.664 |
| 535.9 | 0.66 |
| 536.13 | 0.65 |
| 536.35 | 0.632 |
| 536.58 | 0.636 |
| 536.81 | 0.618 |
| 537.03 | 0.624 |
| 537.26 | 0.618 |
| 537.49 | 0.614 |
| 537.71 | 0.602 |
| 537.94 | 0.596 |
| 538.17 | 0.592 |
| 538.39 | 0.586 |
| 538.62 | 0.572 |
| 538.85 | 0.574 |
| 539.07 | 0.55 |
| 539.3 | 0.556 |
| 539.53 | 0.536 |
| 539.75 | 0.534 |
| 539.98 | 0.524 |
| 540.21 | 0.526 |
| 540.43 | 0.508 |
| 540.66 | 0.507 |
| 540.89 | 0.491 |
| 541.11 | 0.491 |
| 541.34 | 0.478 |
| 541.57 | 0.478 |
| 541.79 | 0.46 |
| 542.02 | 0.473 |
| 542.25 | 0.445 |
| 542.47 | 0.446 |
| 542.7 | 0.432 |
| 542.93 | 0.428 |
| 543.15 | 0.423 |
| 543.38 | 0.421 |
| 543.61 | 0.403 |
| 543.83 | 0.397 |
| 544.06 | 0.388 |
| 544.29 | 0.388 |
| 544.51 | 0.372 |
| 544.74 | 0.37 |
| 544.97 | 0.366 |
| 545.2 | 0.358 |
| 545.42 | 0.342 |
| 545.65 | 0.346 |
| 545.88 | 0.33 |
| 546.1 | 0.328 |
| 546.33 | 0.318 |
| 546.56 | 0.307 |
| 546.78 | 0.3 |
| 547.01 | 0.296 |
| 547.24 | 0.284 |
| 547.47 | 0.284 |
| 547.69 | 0.264 |
| 547.92 | 0.263 |
| 548.15 | 0.255 |
| 548.37 | 0.249 |
| 548.6 | 0.238 |
| 548.83 | 0.239 |
| 549.06 | 0.223 |
| 549.28 | 0.225 |
| 549.51 | 0.216 |
| 549.74 | 0.215 |
| 549.96 | 0.2 |
| 550.19 | 0.199 |
| 550.42 | 0.195 |
| 550.65 | 0.189 |
| 550.87 | 0.181 |
| 551.1 | 0.181 |
| 551.33 | 0.169 |
| 551.55 | 0.157 |
| 551.78 | 0.157 |
| 552.01 | 0.153 |
| 552.24 | 0.148 |
| 552.46 | 0.142 |
| 552.69 | 0.131 |
| 552.92 | 0.132 |
| 553.15 | 0.12 |
| 553.37 | 0.128 |
| 553.6 | 0.104 |
| 553.83 | 0.112 |
| 554.06 | 0.099 |
| 554.28 | 0.102 |
| 554.51 | 0.092 |
| 554.74 | 0.088 |
| 554.97 | 0.082 |
| 555.19 | 0.085 |
| 555.42 | 0.071 |
| 555.65 | 0.076 |
| 555.87 | 0.064 |
| 556.1 | 0.07 |
| 556.33 | 0.062 |
| 556.56 | 0.064 |
| 556.79 | 0.054 |
| 557.01 | 0.055 |
| 557.24 | 0.047 |
| 557.47 | 0.046 |
| 557.7 | 0.039 |
| 557.92 | 0.042 |
| 558.15 | 0.033 |
| 558.38 | 0.035 |
| 558.61 | 0.032 |
| 558.83 | 0.03 |
| 559.06 | 0.027 |
| 559.29 | 0.027 |
| 559.52 | 0.022 |
| 559.74 | 0.024 |
| 559.97 | 0.02 |
| 560.2 | 0.02 |
| 560.43 | 0.018 |
| 560.66 | 0.017 |
| 560.88 | 0.014 |
| 561.11 | 0.014 |
| 561.34 | 0.008 |
| 561.57 | 0.011 |
| 561.79 | 0.009 |
| 562.02 | 0.011 |
| 562.25 | 0.007 |
| 562.48 | 0.006 |
| 562.71 | 0.01 |
| 562.93 | 0.008 |
| 563.16 | 0.009 |
| 563.39 | 0.005 |
| 563.62 | 0.005 |
| 563.84 | 0.006 |
| 564.07 | 0.007 |
| 564.3 | 0.004 |
| 564.53 | 0.005 |
| 564.76 | 0.004 |
| 564.98 | 0.002 |
| 565.21 | 0.002 |
| 565.44 | 0.003 |
| 565.67 | 0.002 |
| 565.9 | 0.003 |
| 566.12 | 0.003 |
| 566.35 | 0.003 |
| 566.58 | 0 |
| 566.81 | 0 |
| 567.04 | 0.003 |
| 567.26 | -0.001 |
| 567.49 | 0.001 |
| 567.72 | 0.003 |
| 567.95 | 0.002 |
| 568.18 | 0.002 |
| 568.41 | 0.001 |
| 568.63 | 0.001 |
| 568.86 | 0 |
| 569.09 | 0 |
| 569.32 | 0 |
| 569.55 | 0.001 |
| 569.77 | 0.003 |
| 570.0 | -0.001 |
| 570.23 | -0.001 |
| 570.46 | 0.001 |
| 570.69 | 0 |
| 570.92 | 0 |
| 571.14 | 0 |
| 571.37 | 0.002 |
| 571.6 | -0.003 |
| 571.83 | 0.002 |
| 572.06 | 0 |
| 572.29 | 0.001 |
| 572.51 | -0.003 |
| 572.74 | 0.002 |
| 572.97 | -0.002 |
| 573.2 | 0.001 |
| 573.43 | -0.002 |
| 573.66 | 0 |
| 573.88 | -0.001 |
| 574.11 | 0 |
| 574.34 | 0.003 |
| 574.57 | 0.003 |
| 574.8 | 0 |
| 575.03 | 0.001 |
| 575.26 | 0.001 |
| 575.48 | -0.001 |
| 575.71 | -0.001 |
| 575.94 | -0.003 |
| 576.17 | 0 |
| 576.4 | 0 |
| 576.63 | 0.001 |
| 576.85 | -0.003 |
| 577.08 | -0.001 |
| 577.31 | 0 |
| 577.54 | -0.001 |
| 577.77 | 0 |
| 578.0 | 0.001 |
| 578.23 | -0.003 |
| 578.46 | -0.002 |
| 578.68 | 0 |
| 578.91 | 0.001 |
| 579.14 | 0 |
| 579.37 | 0 |
| 579.6 | -0.002 |
| 579.83 | 0.001 |
| 580.06 | -0.001 |
| 580.28 | -0.002 |
| 580.51 | -0.001 |
| 580.74 | -0.001 |
| 580.97 | 0 |
| 581.2 | -0.001 |
| 581.43 | -0.001 |
| 581.66 | 0 |
| 581.89 | -0.001 |
| 582.12 | -0.001 |
| 582.34 | -0.001 |
| 582.57 | -0.001 |
| 582.8 | -0.001 |
| 583.03 | 0.002 |
| 583.26 | -0.002 |
| 583.49 | -0.001 |
| 583.72 | -0.002 |
| 583.95 | 0 |
| 584.18 | 0.001 |
| 584.4 | 0.001 |
| 584.63 | -0.002 |
| 584.86 | 0 |
| 585.09 | -0.001 |
| 585.32 | -0.001 |
| 585.55 | -0.001 |
| 585.78 | 0.001 |
| 586.01 | 0.002 |
| 586.24 | -0.002 |
| 586.47 | -0.001 |
| 586.69 | 0 |
| 586.92 | -0.001 |
| 587.15 | 0.001 |
| 587.38 | -0.001 |
| 587.61 | 0.001 |
| 587.84 | 0.002 |
| 588.07 | 0 |
| 588.3 | 0 |
| 588.53 | -0.001 |
| 588.76 | 0.004 |
| 588.99 | -0.001 |
| 589.21 | -0.001 |
| 589.44 | 0 |
| 589.67 | 0 |
| 589.9 | 0 |
| 590.13 | 0 |
| 590.36 | 0 |
| 590.59 | 0 |
| 590.82 | 0.002 |
| 591.05 | -0.003 |
| 591.28 | -0.001 |
| 591.51 | -0.003 |
| 591.74 | 0.001 |
| 591.97 | -0.002 |
| 592.19 | 0.001 |
| 592.42 | -0.002 |
| 592.65 | 0 |
| 592.88 | -0.001 |
| 593.11 | 0 |
| 593.34 | -0.002 |
| 593.57 | -0.001 |
| 593.8 | -0.003 |
| 594.03 | 0 |
| 594.26 | 0 |
| 594.49 | -0.001 |
| 594.72 | -0.002 |
| 594.95 | 0.001 |
| 595.18 | 0 |
| 595.41 | 0.002 |
| 595.64 | -0.002 |
| 595.87 | 0 |
| 596.1 | -0.002 |
| 596.32 | -0.001 |
| 596.55 | 0.001 |
| 596.78 | -0.001 |
| 597.01 | 0 |
| 597.24 | -0.002 |
| 597.47 | -0.001 |
| 597.7 | 0 |
| 597.93 | 0.001 |
| 598.16 | 0 |
| 598.39 | -0.004 |
| 598.62 | 0 |
| 598.85 | 0 |
| 599.08 | -0.001 |
| 599.31 | -0.001 |
| 599.54 | -0.001 |
| 599.77 | -0.001 |
| 600.0 | 0 |
| 600.23 | 0.001 |
| 600.46 | 0.002 |
| 600.69 | -0.001 |
| 600.92 | 0 |
| 601.15 | -0.002 |
| 601.38 | -0.002 |
| 601.61 | 0 |
| 601.84 | 0 |
| 602.07 | 0.001 |
| 602.3 | 0 |
| 602.53 | -0.001 |
| 602.76 | 0.001 |
| 602.99 | -0.003 |
| 603.22 | -0.002 |
| 603.45 | 0 |
| 603.68 | -0.001 |
| 603.91 | 0 |
| 604.14 | 0.001 |
| 604.36 | -0.001 |
| 604.59 | 0 |
| 604.82 | 0 |
| 605.05 | 0 |
| 605.28 | -0.001 |
| 605.51 | -0.001 |
| 605.74 | -0.001 |
| 605.97 | 0.001 |
| 606.2 | 0.001 |
| 606.43 | -0.001 |
| 606.66 | -0.002 |
| 606.89 | -0.002 |
| 607.12 | -0.001 |
| 607.35 | 0.002 |
| 607.58 | -0.002 |
| 607.81 | 0 |
| 608.05 | 0 |
| 608.28 | -0.002 |
| 608.51 | 0 |
| 608.74 | -0.002 |
| 608.97 | 0.001 |
| 609.2 | -0.003 |
| 609.43 | 0 |
| 609.66 | 0.001 |
| 609.89 | 0.002 |
| 610.12 | -0.002 |
| 610.35 | 0.001 |
| 610.58 | -0.001 |
| 610.81 | -0.001 |
| 611.04 | 0.003 |
| 611.27 | -0.002 |
| 611.5 | 0 |
| 611.73 | 0.001 |
| 611.96 | -0.002 |
| 612.19 | -0.003 |
| 612.42 | 0.001 |
| 612.65 | 0.002 |
| 612.88 | -0.002 |
| 613.11 | -0.001 |
| 613.34 | -0.001 |
| 613.57 | -0.001 |
| 613.8 | 0.002 |
| 614.03 | -0.002 |
| 614.26 | -0.001 |
| 614.49 | 0.001 |
| 614.72 | 0 |
| 614.95 | -0.002 |
| 615.18 | 0 |
| 615.41 | 0 |
| 615.64 | 0 |
| 615.87 | 0.002 |
| 616.1 | 0.002 |
| 616.34 | 0.001 |
| 616.57 | 0.001 |
| 616.8 | -0.001 |
| 617.03 | -0.002 |
| 617.26 | 0 |
| 617.49 | -0.001 |
| 617.72 | 0 |
| 617.95 | -0.001 |
| 618.18 | -0.002 |
| 618.41 | -0.001 |
| 618.64 | -0.001 |
| 618.87 | 0.001 |
| 619.1 | -0.002 |
| 619.33 | 0 |
| 619.56 | -0.002 |
| 619.79 | 0 |
| 620.02 | -0.002 |
| 620.26 | -0.001 |
| 620.49 | -0.001 |
| 620.72 | -0.002 |
| 620.95 | 0.001 |
| 621.18 | -0.001 |
| 621.41 | -0.001 |
| 621.64 | -0.003 |
| 621.87 | -0.001 |
| 622.1 | 0 |
| 622.33 | -0.002 |
| 622.56 | 0 |
| 622.79 | 0.001 |
| 623.02 | -0.001 |
| 623.25 | 0 |
| 623.49 | -0.002 |
| 623.72 | -0.001 |
| 623.95 | -0.001 |
| 624.18 | -0.004 |
| 624.41 | -0.002 |
| 624.64 | 0 |
| 624.87 | 0.001 |
| 625.1 | -0.002 |
| 625.33 | -0.001 |
| 625.56 | 0.001 |
| 625.79 | 0 |
| 626.03 | -0.001 |
| 626.26 | 0 |
| 626.49 | -0.002 |
| 626.72 | -0.001 |
| 626.95 | -0.002 |
| 627.18 | 0.001 |
| 627.41 | -0.001 |
| 627.64 | 0 |
| 627.87 | -0.001 |
| 628.1 | 0.001 |
| 628.33 | -0.003 |
| 628.57 | -0.002 |
| 628.8 | -0.002 |
| 629.03 | -0.001 |
| 629.26 | 0 |
| 629.49 | -0.003 |
| 629.72 | -0.002 |
| 629.95 | 0 |
| 630.18 | 0 |
| 630.41 | 0 |
| 630.65 | -0.003 |
| 630.88 | -0.001 |
| 631.11 | 0 |
| 631.34 | 0.001 |
| 631.57 | 0 |
| 631.8 | 0 |
| 632.03 | -0.002 |
| 632.26 | 0.001 |
| 632.5 | -0.003 |
| 632.73 | 0.001 |
| 632.96 | -0.002 |
| 633.19 | 0 |
| 633.42 | -0.003 |
| 633.65 | -0.001 |
| 633.88 | 0.002 |
| 634.11 | 0 |
| 634.35 | -0.001 |
| 634.58 | 0 |
| 634.81 | 0 |
| 635.04 | 0 |
| 635.27 | 0 |
| 635.5 | -0.001 |
| 635.73 | 0.002 |
| 635.96 | -0.001 |
| 636.2 | -0.001 |
| 636.43 | -0.001 |
| 636.66 | 0.001 |
| 636.89 | 0.001 |
| 637.12 | -0.001 |
| 637.35 | -0.002 |
| 637.58 | -0.001 |
| 637.82 | -0.001 |
| 638.05 | 0 |
| 638.28 | -0.001 |
| 638.51 | 0.001 |
| 638.74 | -0.002 |
| 638.97 | 0.001 |
| 639.21 | -0.003 |
| 639.44 | 0 |
| 639.67 | 0 |
| 639.9 | 0.001 |
| 640.13 | 0 |
| 640.36 | -0.001 |
| 640.59 | -0.001 |
| 640.83 | 0 |
| 641.06 | -0.002 |
| 641.29 | -0.001 |
| 641.52 | 0.002 |
| 641.75 | 0.001 |
| 641.98 | -0.002 |
| 642.22 | 0.002 |
| 642.45 | -0.003 |
| 642.68 | 0.001 |
| 642.91 | -0.002 |
| 643.14 | 0.002 |
| 643.37 | -0.002 |
| 643.61 | 0 |
| 643.84 | 0 |
| 644.07 | -0.003 |
| 644.3 | -0.002 |
| 644.53 | -0.001 |
| 644.76 | 0 |
| 645.0 | -0.001 |
| 645.23 | 0 |
| 645.46 | -0.001 |
| 645.69 | -0.003 |
| 645.92 | -0.001 |
| 646.16 | 0.001 |
| 646.39 | -0.001 |
| 646.62 | -0.001 |
| 646.85 | -0.001 |
| 647.08 | -0.003 |
| 647.31 | 0.001 |
| 647.55 | -0.001 |
| 647.78 | -0.001 |
| 648.01 | 0 |
| 648.24 | -0.001 |
| 648.47 | -0.002 |
| 648.71 | 0.002 |
| 648.94 | -0.001 |
| 649.17 | -0.001 |
| 649.4 | -0.002 |
| 649.63 | 0.001 |
| 649.87 | 0 |
| 650.1 | 0 |
| 650.33 | -0.001 |
| 650.56 | 0.001 |
| 650.79 | -0.002 |
| 651.03 | 0.001 |
| 651.26 | -0.002 |
| 651.49 | 0.001 |
| 651.72 | 0 |
| 651.95 | 0.002 |
| 652.19 | -0.001 |
| 652.42 | 0 |
| 652.65 | -0.003 |
| 652.88 | 0 |
| 653.12 | 0.001 |
| 653.35 | -0.001 |
| 653.58 | 0.002 |
| 653.81 | 0.001 |
| 654.04 | 0 |
| 654.28 | -0.001 |
| 654.51 | 0 |
| 654.74 | -0.001 |
| 654.97 | 0 |
| 655.2 | 0 |
| 655.44 | 0 |
| 655.67 | -0.002 |
| 655.9 | -0.001 |
| 656.13 | 0.002 |
| 656.37 | -0.003 |
| 656.6 | 0 |
| 656.83 | 0.002 |
| 657.06 | -0.001 |
| 657.3 | -0.001 |
| 657.53 | -0.002 |
| 657.76 | -0.002 |
| 657.99 | -0.001 |
| 658.22 | 0.002 |
| 658.46 | 0 |
| 658.69 | 0.001 |
| 658.92 | 0.001 |
| 659.15 | -0.002 |
| 659.39 | -0.003 |
| 659.62 | -0.001 |
| 659.85 | 0.001 |
| 660.08 | -0.001 |
| 660.32 | -0.002 |
| 660.55 | -0.001 |
| 660.78 | 0.001 |
| 661.01 | -0.003 |
| 661.25 | 0 |
| 661.48 | -0.001 |
| 661.71 | -0.001 |
| 661.94 | -0.001 |
| 662.18 | 0 |
| 662.41 | -0.003 |
| 662.64 | -0.001 |
| 662.87 | 0 |
| 663.11 | -0.002 |
| 663.34 | 0.001 |
| 663.57 | 0.001 |
| 663.8 | 0.001 |
| 664.04 | 0 |
| 664.27 | -0.001 |
| 664.5 | -0.001 |
| 664.73 | 0 |
| 664.97 | 0.001 |
| 665.2 | 0 |
| 665.43 | 0.003 |
| 665.67 | -0.002 |
| 665.9 | 0 |
| 666.13 | -0.001 |
| 666.36 | -0.002 |
| 666.6 | -0.001 |
| 666.83 | 0.002 |
| 667.06 | -0.002 |
| 667.29 | -0.001 |
| 667.53 | 0 |
| 667.76 | 0.001 |
| 667.99 | -0.001 |
| 668.23 | 0 |
| 668.46 | 0.001 |
| 668.69 | 0 |
| 668.92 | 0 |
| 669.16 | -0.001 |
| 669.39 | -0.002 |
| 669.62 | 0.001 |
| 669.86 | 0 |
| 670.09 | -0.001 |
| 670.32 | 0.001 |
| 670.55 | 0 |
| 670.79 | -0.002 |
| 671.02 | 0 |
| 671.25 | -0.003 |
| 671.49 | 0.002 |
| 671.72 | 0 |
| 671.95 | -0.001 |
| 672.18 | -0.002 |
| 672.42 | 0 |
| 672.65 | -0.002 |
| 672.88 | 0 |
| 673.12 | -0.002 |
| 673.35 | 0.003 |
| 673.58 | 0.001 |
| 673.82 | -0.001 |
| 674.05 | 0.001 |
| 674.28 | -0.001 |
| 674.51 | -0.004 |
| 674.75 | 0 |
| 674.98 | -0.001 |
| 675.21 | -0.001 |
| 675.45 | 0.002 |
| 675.68 | -0.002 |
| 675.91 | -0.004 |
| 676.15 | 0 |
| 676.38 | -0.001 |
| 676.61 | -0.001 |
| 676.85 | -0.002 |
| 677.08 | 0 |
| 677.31 | -0.001 |
| 677.54 | -0.001 |
| 677.78 | 0.001 |
| 678.01 | 0.002 |
| 678.24 | -0.003 |
| 678.48 | 0 |
| 678.71 | -0.002 |
| 678.94 | -0.001 |
| 679.18 | -0.001 |
| 679.41 | 0.001 |
| 679.64 | 0.001 |
| 679.88 | 0 |
| 680.11 | -0.002 |
| 680.34 | -0.001 |
| 680.58 | 0 |
| 680.81 | -0.002 |
| 681.04 | -0.003 |
| 681.28 | -0.001 |
| 681.51 | 0 |
| 681.74 | -0.001 |
| 681.98 | -0.004 |
| 682.21 | -0.002 |
| 682.44 | -0.001 |
| 682.68 | 0.002 |
| 682.91 | -0.002 |
| 683.14 | 0.002 |
| 683.38 | -0.003 |
| 683.61 | -0.001 |
| 683.84 | 0 |
| 684.08 | -0.001 |
| 684.31 | 0 |
| 684.54 | -0.001 |
| 684.78 | 0 |
| 685.01 | 0.001 |
| 685.25 | 0 |
| 685.48 | -0.002 |
| 685.71 | 0 |
| 685.95 | 0.001 |
| 686.18 | 0 |
| 686.41 | -0.001 |
| 686.65 | 0 |
| 686.88 | 0.001 |
| 687.11 | -0.002 |
| 687.35 | 0 |
| 687.58 | 0 |
| 687.81 | 0 |
| 688.05 | -0.002 |
| 688.28 | 0 |
| 688.52 | -0.002 |
| 688.75 | 0.002 |
| 688.98 | 0 |
| 689.22 | -0.001 |
| 689.45 | -0.001 |
| 689.68 | 0 |
| 689.92 | -0.001 |
| 690.15 | -0.003 |
| 690.38 | -0.001 |
| 690.62 | 0 |
| 690.85 | -0.002 |
| 691.09 | 0.001 |
| 691.32 | -0.001 |
| 691.55 | 0.002 |
| 691.79 | -0.003 |
| 692.02 | 0.001 |
| 692.25 | 0 |
| 692.49 | -0.001 |
| 692.72 | -0.001 |
| 692.96 | 0 |
| 693.19 | -0.002 |
| 693.42 | -0.002 |
| 693.66 | 0 |
| 693.89 | -0.002 |
| 694.12 | 0 |
| 694.36 | -0.003 |
| 694.59 | -0.001 |
| 694.83 | -0.001 |
| 695.06 | 0 |
| 695.29 | 0 |
| 695.53 | 0 |
| 695.76 | -0.002 |
| 696.0 | 0 |
| 696.23 | 0.001 |
| 696.46 | 0.003 |
| 696.7 | 0 |
| 696.93 | -0.001 |
| 697.17 | -0.003 |
| 697.4 | -0.001 |
| 697.63 | -0.001 |
| 697.87 | -0.001 |
| 698.1 | 0.001 |
| 698.34 | -0.001 |
| 698.57 | 0 |
| 698.8 | -0.002 |
| 699.04 | -0.003 |
| 699.27 | 0 |
| 699.51 | 0 |
| 699.74 | 0.002 |
| 699.97 | -0.002 |
| 700.21 | 0.002 |
| 700.44 | 0 |
| 700.68 | -0.001 |
| 700.91 | 0.001 |
| 701.14 | 0 |
| 701.38 | 0 |
| 701.61 | 0.001 |
| 701.85 | 0 |
| 702.08 | -0.001 |
| 702.32 | 0 |
| 702.55 | -0.001 |
| 702.78 | 0 |
| 703.02 | 0.001 |
| 703.25 | -0.001 |
| 703.49 | 0 |
| 703.72 | -0.001 |
| 703.96 | 0 |
| 704.19 | -0.003 |
| 704.42 | -0.001 |
| 704.66 | 0 |
| 704.89 | -0.001 |
| 705.13 | 0 |
| 705.36 | -0.001 |
| 705.6 | -0.001 |
| 705.83 | 0 |
| 706.06 | -0.001 |
| 706.3 | 0 |
| 706.53 | -0.001 |
| 706.77 | 0 |
| 707.0 | -0.001 |
| 707.24 | 0 |
| 707.47 | -0.001 |
| 707.7 | 0 |
| 707.94 | -0.002 |
| 708.17 | 0.001 |
| 708.41 | -0.002 |
| 708.64 | 0.001 |
| 708.88 | -0.001 |
| 709.11 | 0.002 |
| 709.35 | -0.001 |
| 709.58 | 0 |
| 709.81 | 0 |
| 710.05 | -0.001 |
| 710.28 | -0.002 |
| 710.52 | -0.002 |
| 710.75 | 0.001 |
| 710.99 | 0 |
| 711.22 | -0.002 |
| 711.46 | 0 |
| 711.69 | -0.001 |
| 711.92 | 0 |
| 712.16 | -0.001 |
| 712.39 | -0.002 |
| 712.63 | -0.001 |
| 712.86 | 0 |
| 713.1 | -0.001 |
| 713.33 | -0.002 |
| 713.57 | -0.002 |
| 713.8 | -0.001 |
| 714.04 | -0.002 |
| 714.27 | 0 |
| 714.51 | 0 |
| 714.74 | 0 |
| 714.97 | 0 |
| 715.21 | 0 |
| 715.44 | -0.002 |
| 715.68 | 0.001 |
| 715.91 | -0.001 |
| 716.15 | 0 |
| 716.38 | -0.002 |
| 716.62 | -0.001 |
| 716.85 | -0.002 |
| 717.09 | 0 |
| 717.32 | -0.001 |
| 717.56 | -0.003 |
| 717.79 | 0.001 |
| 718.03 | -0.003 |
| 718.26 | -0.003 |
| 718.5 | 0 |
| 718.73 | -0.001 |
| 718.97 | 0 |
| 719.2 | -0.001 |
| 719.44 | 0 |
| 719.67 | -0.001 |
| 719.91 | -0.002 |
| 720.14 | 0 |
| 720.37 | -0.001 |
| 720.61 | 0.001 |
| 720.84 | 0 |
| 721.08 | -0.002 |
| 721.31 | 0.002 |
| 721.55 | 0 |
| 721.78 | 0.001 |
| 722.02 | -0.001 |
| 722.25 | 0 |
| 722.49 | -0.002 |
| 722.72 | 0.002 |
| 722.96 | 0 |
| 723.19 | 0.003 |
| 723.43 | 0 |
| 723.66 | -0.002 |
| 723.9 | 0.001 |
| 724.13 | 0.001 |
| 724.37 | -0.004 |
| 724.6 | 0 |
| 724.84 | -0.001 |
| 725.07 | 0 |
| 725.31 | -0.001 |
| 725.54 | 0 |
| 725.78 | 0 |
| 726.01 | 0 |
| 726.25 | 0 |
| 726.48 | 0.001 |
| 726.72 | -0.001 |
| 726.96 | -0.002 |
| 727.19 | -0.002 |
| 727.43 | -0.001 |
| 727.66 | 0.001 |
| 727.9 | 0 |
| 728.13 | 0.008 |
| 728.37 | -0.001 |
| 728.6 | -0.003 |
| 728.84 | 0.001 |
| 729.07 | -0.001 |
| 729.31 | 0 |
| 729.54 | -0.002 |
| 729.78 | 0.001 |
| 730.01 | 0 |
| 730.25 | -0.003 |
| 730.48 | -0.001 |
| 730.72 | -0.001 |
| 730.95 | -0.003 |
| 731.19 | -0.002 |
| 731.42 | 0 |
| 731.66 | -0.002 |
| 731.89 | -0.002 |
| 732.13 | -0.001 |
| 732.37 | -0.002 |
| 732.6 | 0 |
| 732.84 | -0.002 |
| 733.07 | -0.001 |
| 733.31 | -0.002 |
| 733.54 | 0.001 |
| 733.78 | -0.003 |
| 734.01 | -0.003 |
| 734.25 | 0 |
| 734.48 | 0.001 |
| 734.72 | -0.001 |
| 734.95 | 0.003 |
| 735.19 | -0.001 |
| 735.43 | -0.002 |
| 735.66 | 0.001 |
| 735.9 | -0.001 |
| 736.13 | -0.001 |
| 736.37 | 0.001 |
| 736.6 | -0.002 |
| 736.84 | -0.001 |
| 737.07 | -0.001 |
| 737.31 | -0.001 |
| 737.55 | 0 |
| 737.78 | 0 |
| 738.02 | -0.001 |
| 738.25 | 0 |
| 738.49 | -0.001 |
| 738.72 | 0.001 |
| 738.96 | 0 |
| 739.19 | 0 |
| 739.43 | -0.002 |
| 739.67 | 0.001 |
| 739.9 | 0.001 |
| 740.14 | 0.001 |
| 740.37 | -0.002 |
| 740.61 | -0.002 |
| 740.84 | 0 |
| 741.08 | 0.001 |
| 741.31 | -0.001 |
| 741.55 | -0.002 |
| 741.79 | -0.001 |
| 742.02 | 0.001 |
| 742.26 | 0 |
| 742.49 | -0.001 |
| 742.73 | 0 |
| 742.96 | 0.002 |
| 743.2 | 0 |
| 743.44 | 0 |
| 743.67 | -0.003 |
| 743.91 | -0.001 |
| 744.14 | -0.003 |
| 744.38 | 0 |
| 744.61 | 0 |
| 744.85 | -0.003 |
| 745.09 | 0 |
| 745.32 | -0.001 |
| 745.56 | -0.001 |
| 745.79 | 0 |
| 746.03 | -0.002 |
| 746.27 | 0.001 |
| 746.5 | -0.001 |
| 746.74 | 0.001 |
| 746.97 | 0.002 |
| 747.21 | -0.001 |
| 747.44 | 0 |
| 747.68 | 0 |
| 747.92 | -0.001 |
| 748.15 | 0.001 |
| 748.39 | -0.001 |
| 748.62 | -0.001 |
| 748.86 | -0.003 |
| 749.1 | 0 |
| 749.33 | 0 |
| 749.57 | -0.002 |
| 749.8 | -0.003 |
| 750.04 | -0.001 |
| 750.28 | 0.002 |
| 750.51 | 0 |
| 750.75 | -0.001 |
| 750.98 | 0 |
| 751.22 | -0.002 |
| 751.46 | 0 |
| 751.69 | -0.002 |
| 751.93 | -0.003 |
| 752.16 | 0 |
| 752.4 | -0.002 |
| 752.64 | 0.001 |
| 752.87 | 0 |
| 753.11 | 0 |
| 753.34 | -0.002 |
| 753.58 | 0 |
| 753.82 | -0.001 |
| 754.05 | 0.002 |
| 754.29 | -0.001 |
| 754.53 | -0.001 |
| 754.76 | -0.002 |
| 755.0 | -0.001 |
| 755.23 | -0.004 |
| 755.47 | 0.001 |
| 755.71 | 0 |
| 755.94 | -0.002 |
| 756.18 | 0 |
| 756.41 | 0 |
| 756.65 | -0.001 |
| 756.89 | 0 |
| 757.12 | -0.001 |
| 757.36 | 0.001 |
| 757.6 | 0 |
| 757.83 | 0 |
| 758.07 | 0.001 |
| 758.3 | 0.001 |
| 758.54 | -0.001 |
| 758.78 | -0.001 |
| 759.01 | -0.001 |
| 759.25 | -0.002 |
| 759.49 | -0.001 |
| 759.72 | 0.002 |
| 759.96 | 0 |
| 760.2 | 0 |
| 760.43 | 0.002 |
| 760.67 | 0 |
| 760.9 | -0.001 |
| 761.14 | -0.001 |
| 761.38 | -0.001 |
| 761.61 | -0.001 |
| 761.85 | -0.001 |
| 762.09 | 0.002 |
| 762.32 | 0.001 |
| 762.56 | -0.002 |
| 762.8 | -0.001 |
| 763.03 | 0 |
| 763.27 | -0.001 |
| 763.5 | 0.001 |
| 763.74 | -0.002 |
| 763.98 | -0.001 |
| 764.21 | -0.001 |
| 764.45 | 0 |
| 764.69 | -0.001 |
| 764.92 | 0 |
| 765.16 | -0.002 |
| 765.4 | 0 |
| 765.63 | -0.001 |
| 765.87 | -0.002 |
| 766.11 | 0 |
| 766.34 | 0.001 |
| 766.58 | 0 |
| 766.82 | 0.001 |
| 767.05 | 0.001 |
| 767.29 | 0.003 |
| 767.53 | -0.001 |
| 767.76 | 0 |
| 768.0 | -0.001 |
| 768.24 | 0 |
| 768.47 | -0.003 |
| 768.71 | 0.001 |
| 768.95 | 0 |
| 769.18 | -0.001 |
| 769.42 | 0.002 |
| 769.66 | 0 |
| 769.89 | 0 |
| 770.13 | 0 |
| 770.37 | -0.002 |
| 770.6 | 0 |
| 770.84 | 0.002 |
| 771.08 | 0 |
| 771.31 | 0 |
| 771.55 | 0.001 |
| 771.79 | -0.001 |
| 772.02 | -0.001 |
| 772.26 | -0.001 |
| 772.5 | 0.002 |
| 772.73 | -0.001 |
| 772.97 | 0 |
| 773.21 | 0 |
| 773.44 | 0.003 |
| 773.68 | 0 |
| 773.92 | 0.002 |
| 774.15 | 0 |
| 774.39 | 0 |
| 774.63 | -0.001 |
| 774.86 | 0 |
| 775.1 | 0 |
| 775.34 | -0.001 |
| 775.57 | 0.001 |
| 775.81 | 0.001 |
| 776.05 | -0.001 |
| 776.29 | 0.001 |
| 776.52 | 0.002 |
| 776.76 | 0.001 |
| 777.0 | -0.002 |
| 777.23 | -0.001 |
| 777.47 | -0.001 |
| 777.71 | 0 |
| 777.94 | -0.001 |
| 778.18 | -0.001 |
| 778.42 | -0.002 |
| 778.65 | 0 |
| 778.89 | 0 |
| 779.13 | -0.001 |
| 779.37 | -0.004 |
| 779.6 | -0.003 |
| 779.84 | 0 |
| 780.08 | -0.002 |
| 780.31 | 0.001 |
| 780.55 | 0.001 |
| 780.79 | -0.002 |
| 781.02 | -0.003 |
| 781.26 | 0 |
| 781.5 | 0 |
| 781.74 | -0.003 |
| 781.97 | 0 |
| 782.21 | 0 |
| 782.45 | -0.001 |
| 782.68 | -0.003 |
| 782.92 | -0.001 |
| 783.16 | -0.001 |
| 783.4 | 0 |
| 783.63 | 0.002 |
| 783.87 | 0 |
| 784.11 | -0.002 |
| 784.34 | 0 |
| 784.58 | -0.001 |
| 784.82 | -0.001 |
| 785.06 | 0 |
| 785.29 | 0.002 |
| 785.53 | 0 |
| 785.77 | 0.003 |
| 786.0 | 0 |
| 786.24 | -0.001 |
| 786.48 | 0 |
| 786.72 | -0.001 |
| 786.95 | 0 |
| 787.19 | -0.001 |
| 787.43 | -0.001 |
| 787.67 | -0.002 |
| 787.9 | -0.001 |
| 788.14 | 0.002 |
| 788.38 | 0 |
| 788.61 | -0.001 |
| 788.85 | -0.002 |
| 789.09 | -0.001 |
| 789.33 | -0.001 |
| 789.56 | -0.001 |
| 789.8 | -0.002 |
| 790.04 | 0.002 |
| 790.28 | -0.003 |
| 790.51 | 0 |
| 790.75 | -0.002 |
| 790.99 | -0.001 |
| 791.23 | -0.002 |
| 791.46 | -0.002 |
| 791.7 | -0.001 |
| 791.94 | -0.002 |
| 792.17 | -0.002 |
| 792.41 | 0.002 |
| 792.65 | -0.001 |
| 792.89 | 0 |
| 793.12 | 0.003 |
| 793.36 | -0.002 |
| 793.6 | -0.002 |
| 793.84 | -0.001 |
| 794.07 | -0.002 |
| 794.31 | -0.001 |
| 794.55 | -0.003 |
| 794.79 | 0 |
| 795.02 | -0.002 |
| 795.26 | -0.002 |
| 795.5 | 0.001 |
| 795.74 | 0.003 |
| 795.97 | -0.001 |
| 796.21 | -0.001 |
| 796.45 | -0.001 |
| 796.69 | -0.001 |
| 796.92 | 0.001 |
| 797.16 | 0 |
| 797.4 | -0.002 |
| 797.64 | -0.001 |
| 797.88 | 0 |
| 798.11 | -0.002 |
| 798.35 | -0.001 |
| 798.59 | 0.001 |
| 798.83 | -0.002 |
| 799.06 | -0.001 |
| 799.3 | 0.001 |
| 799.54 | 0 |
| 799.78 | -0.002 |
| 800.01 | 0.001 |
| 800.25 | 0 |
| 800.49 | 0 |
| 800.73 | 0 |
| 800.96 | -0.002 |
| 801.2 | -0.001 |
| 801.44 | 0.001 |
| 801.68 | -0.001 |
| 801.92 | -0.003 |
| 802.15 | -0.001 |
| 802.39 | 0.001 |
| 802.63 | -0.004 |
| 802.87 | 0 |
| 803.1 | 0 |
| 803.34 | 0 |
| 803.58 | -0.003 |
| 803.82 | 0.001 |
| 804.06 | -0.003 |
| 804.29 | 0 |
| 804.53 | 0.001 |
| 804.77 | 0.001 |
| 805.01 | -0.004 |
| 805.24 | 0.001 |
| 805.48 | 0 |
| 805.72 | 0 |
| 805.96 | 0 |
| 806.2 | 0 |
| 806.43 | 0 |
| 806.67 | 0.001 |
| 806.91 | 0 |
| 807.15 | 0 |
| 807.39 | -0.003 |
| 807.62 | -0.002 |
| 807.86 | 0 |
| 808.1 | 0 |
| 808.34 | -0.004 |
| 808.58 | -0.003 |
| 808.81 | 0.001 |
| 809.05 | 0.001 |
| 809.29 | -0.002 |
| 809.53 | 0.003 |
| 809.76 | -0.001 |
| 810.0 | 0.001 |
| 810.24 | 0 |
| 810.48 | 0.002 |
| 810.72 | -0.002 |
| 810.95 | 0 |
| 811.19 | -0.001 |
| 811.43 | 0.001 |
| 811.67 | -0.003 |
| 811.91 | 0.001 |
| 812.15 | 0 |
| 812.38 | 0.001 |
| 812.62 | -0.003 |
| 812.86 | -0.001 |
| 813.1 | -0.002 |
| 813.34 | 0 |
| 813.57 | -0.002 |
| 813.81 | 0.001 |
| 814.05 | 0.001 |
| 814.29 | -0.002 |
| 814.53 | 0.001 |
| 814.76 | -0.001 |
| 815.0 | 0 |
| 815.24 | 0.003 |
| 815.48 | -0.002 |
| 815.72 | 0.001 |
| 815.95 | -0.001 |
| 816.19 | -0.002 |
| 816.43 | -0.001 |
| 816.67 | 0 |
| 816.91 | 0 |
| 817.15 | -0.001 |
| 817.38 | 0.001 |
| 817.62 | 0 |
| 817.86 | 0 |
| 818.1 | 0 |
| 818.34 | 0 |
| 818.58 | -0.001 |
| 818.81 | 0 |
| 819.05 | 0.001 |
| 819.29 | 0.001 |
| 819.53 | -0.002 |
| 819.77 | 0.001 |
| 820.0 | -0.001 |
| 820.24 | -0.001 |
| 820.48 | -0.001 |
| 820.72 | 0 |
| 820.96 | 0.001 |
| 821.2 | 0.002 |
| 821.43 | 0 |
| 821.67 | 0.001 |
| 821.91 | -0.001 |
| 822.15 | -0.002 |
| 822.39 | -0.001 |
| 822.63 | 0.001 |
| 822.86 | 0 |
| 823.1 | 0 |
| 823.34 | -0.001 |
| 823.58 | 0 |
| 823.82 | 0 |
| 824.06 | 0 |
| 824.3 | 0 |
| 824.53 | 0.002 |
| 824.77 | -0.001 |
| 825.01 | -0.002 |
| 825.25 | -0.001 |
| 825.49 | 0.001 |
| 825.73 | -0.003 |
| 825.96 | -0.001 |
| 826.2 | -0.001 |
| 826.44 | 0.001 |
| 826.68 | 0 |
| 826.92 | -0.001 |
| 827.16 | -0.001 |
| 827.4 | 0.001 |
| 827.63 | -0.001 |
| 827.87 | -0.002 |
| 828.11 | -0.003 |
| 828.35 | -0.001 |
| 828.59 | 0 |
| 828.83 | 0 |
| 829.07 | 0 |
| 829.3 | -0.001 |
| 829.54 | 0.001 |
| 829.78 | 0 |
| 830.02 | -0.001 |
| 830.26 | -0.001 |
| 830.5 | 0 |
| 830.74 | -0.001 |
| 830.97 | 0.002 |
| 831.21 | 0 |
| 831.45 | 0.001 |
| 831.69 | 0 |
| 831.93 | -0.001 |
| 832.17 | -0.001 |
| 832.41 | -0.001 |
| 832.64 | 0 |
| 832.88 | -0.002 |
| 833.12 | 0.001 |
| 833.36 | 0 |
| 833.6 | -0.003 |
| 833.84 | 0 |
| 834.08 | -0.001 |
| 834.32 | 0.002 |
| 834.55 | 0 |
| 834.79 | 0 |
| 835.03 | -0.003 |
| 835.27 | 0 |
| 835.51 | 0 |
| 835.75 | -0.001 |
| 835.99 | 0 |
| 836.23 | -0.001 |
| 836.46 | 0 |
| 836.7 | -0.001 |
| 836.94 | 0.002 |
| 837.18 | 0.001 |
| 837.42 | -0.001 |
| 837.66 | -0.002 |
| 837.9 | 0.001 |
| 838.14 | -0.001 |
| 838.38 | -0.001 |
| 838.61 | -0.001 |
| 838.85 | -0.001 |
| 839.09 | -0.002 |
| 839.33 | -0.002 |
| 839.57 | -0.002 |
| 839.81 | 0.001 |
| 840.05 | -0.001 |
| 840.29 | -0.001 |
| 840.52 | -0.004 |
| 840.76 | -0.001 |
| 841.0 | -0.001 |
| 841.24 | 0 |
| 841.48 | -0.003 |
| 841.72 | 0.001 |
| 841.96 | 0 |
| 842.2 | -0.002 |
| 842.44 | 0 |
| 842.68 | 0 |
| 842.91 | 0 |
| 843.15 | 0.003 |
| 843.39 | -0.001 |
| 843.63 | 0 |
| 843.87 | -0.001 |
| 844.11 | -0.002 |
| 844.35 | 0.001 |
| 844.59 | 0.001 |
| 844.83 | -0.001 |
| 845.07 | -0.001 |
| 845.3 | -0.001 |
| 845.54 | 0.001 |
| 845.78 | 0.002 |
| 846.02 | 0.001 |
| 846.26 | 0.002 |
| 846.5 | 0 |
| 846.74 | -0.003 |
| 846.98 | 0 |
| 847.22 | 0 |
| 847.46 | 0.001 |
| 847.7 | 0 |
| 847.93 | -0.001 |
| 848.17 | 0 |
| 848.41 | -0.001 |
| 848.65 | -0.001 |
| 848.89 | -0.001 |
| 849.13 | -0.002 |
| 849.37 | 0 |
| 849.61 | 0 |
| 849.85 | 0 |
| 850.09 | -0.002 |
| 850.33 | 0.001 |
| 850.57 | -0.001 |
| 850.8 | -0.001 |
| 851.04 | 0.002 |
| 851.28 | 0 |
| 851.52 | 0 |
| 851.76 | 0 |
| 852.0 | -0.002 |
| 852.24 | 0 |
| 852.48 | -0.001 |
| 852.72 | 0 |
| 852.96 | -0.002 |
| 853.2 | 0 |
| 853.44 | -0.001 |
| 853.68 | -0.001 |
| 853.91 | -0.001 |
| 854.15 | -0.001 |
| 854.39 | -0.002 |
| 854.63 | 0.001 |
| 854.87 | -0.001 |
| 855.11 | 0.002 |
| 855.35 | -0.001 |
| 855.59 | 0.001 |
| 855.83 | -0.001 |
| 856.07 | 0.002 |
| 856.31 | 0.001 |
| 856.55 | 0.002 |
| 856.79 | -0.003 |
| 857.03 | 0.002 |
| 857.27 | 0 |
| 857.5 | 0.001 |
| 857.74 | -0.001 |
| 857.98 | -0.003 |
| 858.22 | 0.001 |
| 858.46 | -0.002 |
| 858.7 | -0.002 |
| 858.94 | 0 |
| 859.18 | -0.002 |
| 859.42 | 0 |
| 859.66 | 0 |
| 859.9 | -0.001 |
| 860.14 | -0.002 |
| 860.38 | -0.002 |
| 860.62 | -0.001 |
| 860.86 | -0.001 |
| 861.1 | 0.001 |
| 861.34 | 0 |
| 861.58 | -0.001 |
| 861.81 | -0.001 |
| 862.05 | 0 |
| 862.29 | -0.003 |
| 862.53 | -0.002 |
| 862.77 | 0.002 |
| 863.01 | 0.001 |
| 863.25 | 0 |
| 863.49 | 0.001 |
| 863.73 | 0.001 |
| 863.97 | -0.002 |
| 864.21 | -0.001 |
| 864.45 | -0.002 |
| 864.69 | -0.001 |
| 864.93 | -0.001 |
| 865.17 | -0.003 |
| 865.41 | -0.001 |
| 865.65 | -0.001 |
| 865.89 | 0 |
| 866.13 | 0.002 |
| 866.37 | -0.001 |
| 866.61 | 0.001 |
| 866.85 | 0.001 |
| 867.09 | -0.001 |
| 867.32 | 0 |
| 867.56 | -0.001 |
| 867.8 | -0.001 |
| 868.04 | 0 |
| 868.28 | -0.001 |
| 868.52 | -0.002 |
| 868.76 | 0 |
| 869.0 | 0 |
| 869.24 | -0.002 |
| 869.48 | -0.001 |
| 869.72 | -0.002 |
| 869.96 | -0.001 |
| 870.2 | -0.001 |
| 870.44 | 0 |
| 870.68 | 0.001 |
| 870.92 | 0 |
| 871.16 | -0.001 |
| 871.4 | 0 |
| 871.64 | -0.001 |
| 871.88 | -0.001 |
| 872.12 | -0.003 |
| 872.36 | 0.001 |
| 872.6 | -0.002 |
| 872.84 | 0.002 |
| 873.08 | -0.003 |
| 873.32 | 0.002 |
| 873.56 | -0.001 |
| 873.8 | 0.001 |
| 874.04 | -0.003 |
| 874.28 | 0.001 |
| 874.52 | -0.001 |
| 874.76 | -0.002 |
| 875.0 | 0.001 |
| 875.24 | -0.002 |
| 875.48 | -0.001 |
| 875.72 | 0.003 |
| 875.96 | 0 |
| 876.2 | 0.001 |
| 876.44 | 0 |
| 876.68 | 0 |
| 876.92 | 0 |
| 877.16 | -0.002 |
| 877.4 | 0.001 |
| 877.64 | -0.002 |
| 877.88 | -0.002 |
| 878.12 | 0 |
| 878.36 | 0 |
| 878.6 | -0.002 |
| 878.84 | -0.002 |
| 879.08 | -0.001 |
| 879.32 | 0.002 |
| 879.56 | 0 |
| 879.8 | -0.001 |
| 880.04 | 0 |
| 880.28 | 0.002 |
| 880.52 | 0 |
| 880.76 | -0.001 |
| 881.0 | -0.002 |
| 881.24 | -0.001 |
| 881.48 | 0 |
| 881.72 | 0 |
| 881.96 | -0.001 |
| 882.2 | 0.001 |
| 882.44 | 0 |
| 882.68 | -0.001 |
| 882.92 | -0.005 |
| 883.16 | -0.001 |
| 883.4 | -0.001 |
| 883.64 | 0.001 |
| 883.88 | -0.001 |
| 884.12 | 0.003 |
| 884.36 | -0.001 |
| 884.6 | -0.003 |
| 884.84 | -0.002 |
| 885.08 | -0.001 |
| 885.32 | -0.001 |
| 885.56 | -0.001 |
| 885.8 | -0.001 |
| 886.04 | 0.001 |
| 886.28 | -0.003 |
| 886.52 | 0.001 |
| 886.76 | -0.001 |
| 887.0 | 0 |
| 887.24 | -0.001 |
| 887.48 | 0.002 |
| 887.72 | -0.002 |
| 887.96 | 0 |
| 888.2 | -0.002 |
| 888.44 | 0.002 |
| 888.68 | -0.002 |
| 888.92 | 0 |
| 889.16 | -0.001 |
| 889.4 | 0.001 |
| 889.64 | 0.001 |
| 889.88 | 0 |
| 890.12 | 0 |
| 890.36 | 0 |
| 890.6 | -0.002 |
| 890.84 | -0.002 |
| 891.08 | -0.002 |
| 891.32 | 0.001 |
| 891.56 | -0.003 |
| 891.8 | 0 |
| 892.04 | 0.001 |
| 892.28 | 0.002 |
| 892.52 | 0.001 |
| 892.76 | -0.002 |
| 893.0 | -0.001 |
| 893.24 | -0.002 |
| 893.48 | -0.002 |
| 893.73 | 0 |
| 893.97 | -0.001 |
| 894.21 | 0.003 |
| 894.45 | 0.002 |
| 894.69 | -0.002 |
| 894.93 | 0.001 |
| 895.17 | 0 |
| 895.41 | 0 |
| 895.65 | 0 |
| 895.89 | -0.001 |
| 896.13 | 0 |
| 896.37 | 0 |
| 896.61 | -0.001 |
| 896.85 | -0.003 |
| 897.09 | -0.001 |
| 897.33 | -0.001 |
| 897.57 | 0.001 |
| 897.81 | -0.004 |
| 898.05 | 0 |
| 898.29 | -0.002 |
| 898.53 | 0.001 |
| 898.77 | 0.001 |
| 899.01 | -0.001 |
| 899.25 | -0.001 |
| 899.5 | 0 |
| 899.74 | -0.002 |
| 899.98 | 0.001 |
| 900.22 | -0.001 |
| 900.46 | 0 |
| 900.7 | 0 |
| 900.94 | 0 |
| 901.18 | 0.002 |
| 901.42 | -0.001 |
| 901.66 | 0 |
| 901.9 | -0.001 |
| 902.14 | 0 |
| 902.38 | 0 |
| 902.62 | -0.002 |
| 902.86 | -0.001 |
| 903.1 | 0.001 |
| 903.34 | -0.001 |
| 903.58 | -0.001 |
| 903.82 | 0.002 |
| 904.07 | 0.001 |
| 904.31 | 0.002 |
| 904.55 | 0 |
| 904.79 | 0 |
| 905.03 | 0.003 |
| 905.27 | 0 |
| 905.51 | 0 |
| 905.75 | -0.001 |
| 905.99 | 0.002 |
| 906.23 | 0.001 |
| 906.47 | 0.001 |
| 906.71 | 0.001 |
| 906.95 | -0.001 |
| 907.19 | 0.001 |
| 907.43 | -0.001 |
| 907.68 | 0.003 |
| 907.92 | 0 |
| 908.16 | -0.002 |
| 908.4 | 0 |
| 908.64 | 0.001 |
| 908.88 | 0 |
| 909.12 | 0.001 |
| 909.36 | 0 |
| 909.6 | -0.001 |
| 909.84 | 0 |
| 910.08 | -0.001 |
| 910.32 | -0.002 |
| 910.56 | -0.001 |
| 910.8 | 0 |
| 911.05 | 0.002 |
| 911.29 | 0.003 |
| 911.53 | 0.001 |
| 911.77 | -0.002 |
| 912.01 | -0.001 |
| 912.25 | 0 |
| 912.49 | 0 |
| 912.73 | 0.001 |
| 912.97 | 0 |
| 913.21 | -0.003 |
| 913.45 | -0.001 |
| 913.69 | 0 |
| 913.93 | -0.001 |
| 914.18 | -0.001 |
| 914.42 | 0 |
| 914.66 | 0.001 |
| 914.9 | -0.001 |
| 915.14 | 0.001 |
| 915.38 | 0.003 |
| 915.62 | -0.002 |
| 915.86 | -0.001 |
| 916.1 | -0.002 |
| 916.34 | -0.003 |
| 916.58 | 0 |
| 916.83 | -0.002 |
| 917.07 | 0.001 |
| 917.31 | 0 |
| 917.55 | -0.001 |
| 917.79 | 0 |
| 918.03 | -0.001 |
| 918.27 | -0.001 |
| 918.51 | -0.001 |
| 918.75 | 0.001 |
| 918.99 | -0.002 |
| 919.23 | 0.001 |
| 919.48 | 0 |
| 919.72 | -0.001 |
| 919.96 | -0.001 |
| 920.2 | -0.001 |
| 920.44 | 0 |
| 920.68 | 0.001 |
| 920.92 | 0 |
| 921.16 | 0.002 |
| 921.4 | -0.001 |
| 921.64 | 0.002 |
| 921.89 | 0 |
| 922.13 | 0.001 |
| 922.37 | 0.001 |
| 922.61 | -0.002 |
| 922.85 | -0.002 |
| 923.09 | 0.002 |
| 923.33 | -0.001 |
| 923.57 | 0.002 |
| 923.81 | -0.002 |
| 924.05 | -0.001 |
| 924.3 | -0.002 |
| 924.54 | -0.001 |
| 924.78 | 0.001 |
| 925.02 | -0.001 |
| 925.26 | -0.001 |
| 925.5 | 0 |
| 925.74 | 0 |
| 925.98 | 0.001 |
| 926.22 | 0 |
| 926.47 | 0.002 |
| 926.71 | -0.001 |
| 926.95 | -0.001 |
| 927.19 | 0.001 |
| 927.43 | -0.001 |
| 927.67 | 0.001 |
| 927.91 | 0 |
| 928.15 | -0.001 |
| 928.4 | -0.001 |
| 928.64 | -0.003 |
| 928.88 | 0.002 |
| 929.12 | -0.002 |
| 929.36 | -0.001 |
| 929.6 | -0.001 |
| 929.84 | 0 |
| 930.08 | -0.002 |
| 930.32 | 0.002 |
| 930.57 | -0.002 |
| 930.81 | 0.002 |
| 931.05 | -0.002 |
| 931.29 | -0.003 |
| 931.53 | 0 |
| 931.77 | 0.001 |
| 932.01 | 0 |
| 932.25 | 0.001 |
| 932.5 | 0 |
| 932.74 | 0.002 |
| 932.98 | -0.001 |
| 933.22 | 0 |
| 933.46 | -0.001 |
| 933.7 | -0.003 |
| 933.94 | 0.001 |
| 934.18 | -0.001 |
| 934.43 | -0.002 |
| 934.67 | -0.001 |
| 934.91 | 0 |
| 935.15 | 0 |
| 935.39 | -0.003 |
| 935.63 | -0.003 |
| 935.87 | 0.001 |
| 936.12 | -0.001 |
| 936.36 | 0 |
| 936.6 | -0.003 |
| 936.84 | 0 |
| 937.08 | 0 |
| 937.32 | 0 |
| 937.56 | -0.002 |
| 937.8 | 0.001 |
| 938.05 | 0 |
| 938.29 | 0 |
| 938.53 | 0.001 |
| 938.77 | 0.001 |
| 939.01 | 0 |
| 939.25 | 0.001 |
| 939.49 | 0 |
| 939.74 | 0.002 |
| 939.98 | -0.001 |
| 940.22 | 0.001 |
| 940.46 | -0.002 |
| 940.7 | -0.001 |
| 940.94 | -0.002 |
| 941.18 | -0.001 |
| 941.43 | 0 |
| 941.67 | 0.001 |
| 941.91 | -0.003 |
| 942.15 | 0 |
| 942.39 | 0.001 |
| 942.63 | 0.001 |
| 942.87 | -0.002 |
| 943.12 | 0.001 |
| 943.36 | 0.001 |
| 943.6 | -0.001 |
| 943.84 | 0.001 |
| 944.08 | 0 |
| 944.32 | -0.003 |
| 944.57 | 0 |
| 944.81 | 0 |
| 945.05 | 0.001 |
| 945.29 | 0.001 |
| 945.53 | 0 |
| 945.77 | 0 |
| 946.01 | -0.001 |
| 946.26 | -0.001 |
| 946.5 | 0 |
| 946.74 | -0.003 |
| 946.98 | 0 |
| 947.22 | -0.001 |
| 947.46 | 0.001 |
| 947.71 | -0.002 |
| 947.95 | 0 |
| 948.19 | -0.001 |
| 948.43 | 0 |
| 948.67 | -0.002 |
| 948.91 | -0.001 |
| 949.16 | 0.002 |
| 949.4 | 0.002 |
| 949.64 | -0.001 |
| 949.88 | 0.003 |
| 950.12 | -0.002 |
| 950.36 | 0 |
| 950.61 | 0 |
| 950.85 | 0 |
| 951.09 | 0 |
| 951.33 | 0 |
| 951.57 | -0.001 |
| 951.81 | 0.001 |
| 952.06 | 0.002 |
| 952.3 | 0.001 |
| 952.54 | -0.001 |
| 952.78 | 0.001 |
| 953.02 | -0.002 |
| 953.26 | -0.002 |
| 953.51 | 0 |
| 953.75 | -0.001 |
| 953.99 | 0.001 |
| 954.23 | 0.001 |
| 954.47 | -0.002 |
| 954.71 | 0.001 |
| 954.96 | -0.001 |
| 955.2 | -0.001 |
| 955.44 | 0 |
| 955.68 | 0 |
| 955.92 | -0.001 |
| 956.16 | -0.001 |
| 956.41 | -0.002 |
| 956.65 | -0.002 |
| 956.89 | -0.001 |
| 957.13 | 0.001 |
| 957.37 | -0.002 |
| 957.62 | 0 |
| 957.86 | -0.001 |
| 958.1 | 0.001 |
| 958.34 | -0.002 |
| 958.58 | -0.001 |
| 958.82 | -0.002 |
| 959.07 | 0 |
| 959.31 | 0 |
| 959.55 | 0.001 |
| 959.79 | 0.001 |
| 960.03 | 0 |
| 960.28 | 0 |
| 960.52 | -0.001 |
| 960.76 | 0 |
| 961.0 | 0 |
| 961.24 | -0.001 |
| 961.48 | 0 |
| 961.73 | -0.001 |
| 961.97 | 0.002 |
| 962.21 | 0 |
| 962.45 | 0.003 |
| 962.69 | 0.001 |
| 962.94 | 0.001 |
| 963.18 | 0.001 |
| 963.42 | 0 |
| 963.66 | -0.001 |
| 963.9 | 0.001 |
| 964.15 | 0.002 |
| 964.39 | -0.001 |
| 964.63 | -0.003 |
| 964.87 | 0 |
| 965.11 | -0.001 |
| 965.36 | -0.002 |
| 965.6 | 0 |
| 965.84 | 0.001 |
| 966.08 | -0.002 |
| 966.32 | 0.002 |
| 966.57 | -0.001 |
| 966.81 | 0.002 |
| 967.05 | -0.001 |
| 967.29 | 0 |
| 967.53 | -0.001 |
| 967.77 | 0 |
| 968.02 | -0.002 |
| 968.26 | -0.001 |
| 968.5 | -0.002 |
| 968.74 | -0.001 |
| 968.99 | 0.001 |
| 969.23 | 0 |
| 969.47 | -0.001 |
| 969.71 | 0.002 |
| 969.95 | 0 |
| 970.2 | -0.001 |
| 970.44 | -0.002 |
| 970.68 | 0 |
| 970.92 | 0 |
| 971.16 | 0.001 |
| 971.41 | 0 |
| 971.65 | -0.001 |
| 971.89 | 0 |
| 972.13 | 0.001 |
| 972.37 | 0 |
| 972.62 | 0 |
| 972.86 | -0.002 |
| 973.1 | -0.001 |
| 973.34 | -0.002 |
| 973.58 | -0.001 |
| 973.83 | 0 |
| 974.07 | 0.001 |
| 974.31 | -0.002 |
| 974.55 | 0.002 |
| 974.8 | 0.001 |
| 975.04 | 0.001 |
| 975.28 | 0 |
| 975.52 | 0 |
| 975.76 | 0.002 |
| 976.01 | -0.001 |
| 976.25 | 0 |
| 976.49 | -0.002 |
| 976.73 | 0.001 |
| 976.97 | 0.002 |
| 977.22 | -0.002 |
| 977.46 | -0.001 |
| 977.7 | -0.002 |
| 977.94 | -0.001 |
| 978.19 | 0.001 |
| 978.43 | 0.002 |
| 978.67 | 0 |
| 978.91 | 0.001 |
| 979.15 | 0 |
| 979.4 | -0.002 |
| 979.64 | -0.001 |
| 979.88 | 0.001 |
| 980.12 | 0.001 |
| 980.37 | 0.001 |
| 980.61 | 0.001 |
| 980.85 | 0.001 |
| 981.09 | 0 |
| 981.33 | -0.002 |
| 981.58 | 0.001 |
| 981.82 | -0.001 |
| 982.06 | -0.002 |
| 982.3 | 0.001 |
| 982.55 | -0.001 |
| 982.79 | 0 |
| 983.03 | 0 |
| 983.27 | 0.002 |
| 983.52 | 0.001 |
| 983.76 | 0.001 |
| 984.0 | 0 |
| 984.24 | 0.002 |
| 984.48 | 0 |
| 984.73 | 0.003 |
| 984.97 | -0.002 |
| 985.21 | 0.001 |
| 985.45 | -0.002 |
| 985.7 | 0 |
| 985.94 | -0.001 |
| 986.18 | 0.001 |
| 986.42 | 0 |
| 986.67 | 0 |
| 986.91 | -0.003 |
| 987.15 | 0.001 |
| 987.39 | 0 |
| 987.63 | 0.001 |
| 987.88 | 0.002 |
| 988.12 | -0.001 |
| 988.36 | 0.001 |
| 988.6 | 0 |
| 988.85 | -0.001 |
| 989.09 | 0 |
| 989.33 | -0.002 |
| 989.57 | 0.003 |
| 989.82 | 0.001 |
| 990.06 | 0.001 |
| 990.3 | -0.001 |
| 990.54 | 0.002 |
| 990.79 | -0.001 |
| 991.03 | 0.001 |
| 991.27 | 0 |
| 991.51 | 0.001 |
| 991.76 | 0 |
| 992.0 | -0.002 |
| 992.24 | 0 |
| 992.48 | 0.002 |
| 992.73 | 0 |
| 992.97 | 0.001 |
| 993.21 | -0.003 |
| 993.45 | 0.001 |
| 993.7 | 0.001 |
| 993.94 | 0.005 |
| 994.18 | -0.001 |
| 994.42 | 0.001 |
| 994.67 | 0.001 |
| 994.91 | 0.002 |
| 995.15 | 0.001 |
| 995.39 | 0.002 |
| 995.64 | 0 |
| 995.88 | 0.001 |
| 996.12 | -0.002 |
| 996.36 | -0.001 |
| 996.61 | 0 |
| 996.85 | 0.001 |
| 997.09 | 0.001 |
| 997.33 | -0.001 |
| 997.58 | -0.001 |
| 997.82 | 0 |
| 998.06 | -0.001 |
| 998.3 | 0 |
| 998.55 | -0.002 |
| 998.79 | -0.002 |
| 999.03 | -0.001 |
| 999.27 | -0.001 |
| 999.52 | 0.002 |
| 999.76 | 0.001 |
| 1000.0 | 0 |
| 1000.2 | -0.001 |
| 1000.5 | 0.002 |
| 1000.7 | -0.003 |
| 1001.0 | 0 |
| 1001.2 | -0.001 |
| 1001.5 | 0 |
| 1001.7 | -0.001 |
| 1001.9 | 0.002 |
| 1002.2 | -0.001 |
| 1002.4 | -0.001 |
| 1002.7 | 0 |
| 1002.9 | 0 |
| 1003.2 | -0.003 |
| 1003.4 | 0.003 |
| 1003.6 | -0.001 |
| 1003.9 | -0.001 |
| 1004.1 | -0.003 |
| 1004.4 | 0 |
| 1004.6 | 0 |
| 1004.9 | 0.001 |
| 1005.1 | -0.001 |
| 1005.3 | 0.001 |
| 1005.6 | -0.003 |
| 1005.8 | -0.001 |
| 1006.1 | 0.002 |
| 1006.3 | 0.001 |
| 1006.6 | -0.001 |
| 1006.8 | 0.002 |
| 1007.0 | 0.001 |
| 1007.3 | 0.002 |
| 1007.5 | 0.002 |
| 1007.8 | 0 |
| 1008.0 | -0.001 |
| 1008.3 | -0.001 |
| 1008.5 | -0.003 |
| 1008.7 | 0 |
| 1009.0 | -0.001 |
| 1009.2 | 0.001 |
| 1009.5 | 0.001 |
| 1009.7 | 0 |
| 1010.0 | 0 |
| 1010.2 | 0.001 |
| 1010.4 | 0 |
| 1010.7 | -0.001 |
| 1010.9 | 0.001 |
| 1011.2 | 0 |
| 1011.4 | -0.001 |
| 1011.7 | 0 |
| 1011.9 | 0 |
| 1012.1 | 0 |
| 1012.4 | -0.002 |
| 1012.6 | 0 |
| 1012.9 | 0.001 |
| 1013.1 | 0.003 |
| 1013.4 | 0 |
| 1013.6 | 0.003 |
| 1013.8 | -0.002 |
| 1014.1 | -0.002 |
| 1014.3 | 0.001 |
| 1014.6 | 0 |
| 1014.8 | -0.001 |
| 1015.1 | 0.002 |
| 1015.3 | -0.004 |
| 1015.5 | 0 |
| 1015.8 | -0.002 |
| 1016.0 | 0.001 |
| 1016.3 | 0 |
| 1016.5 | 0.001 |
| 1016.8 | -0.001 |
| 1017.0 | 0 |
| 1017.2 | -0.001 |
| 1017.5 | 0.002 |
| 1017.7 | -0.001 |
| 1018.0 | 0.001 |
| 1018.2 | -0.001 |
| 1018.5 | 0.001 |
| 1018.7 | 0 |
| 1018.9 | 0.002 |
| 1019.2 | 0 |
| 1019.4 | 0.002 |
| 1019.7 | 0 |
| 1019.9 | -0.002 |
| 1020.2 | 0.001 |
| 1020.4 | 0.001 |
| 1020.6 | -0.003 |
| 1020.9 | -0.004 |
| 1021.1 | -0.005 |
| 1021.4 | -0.002 |
| 1021.6 | -0.003 |
| 1021.9 | -0.001 |